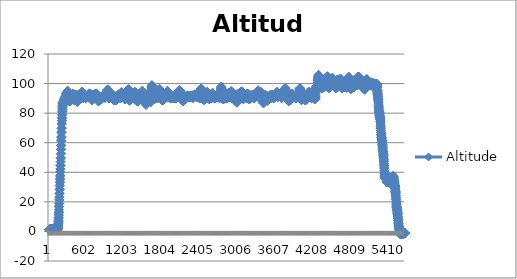
| Category | Altitude |
|---|---|
| 0 | 1.167 |
| 1 | 1.167 |
| 2 | 1.167 |
| 3 | 1.333 |
| 4 | 1.333 |
| 5 | 1.333 |
| 6 | 1.5 |
| 7 | 1.5 |
| 8 | 1.333 |
| 9 | 1.167 |
| 10 | 1.333 |
| 11 | 1.167 |
| 12 | 1.333 |
| 13 | 1.333 |
| 14 | 1.167 |
| 15 | 1.167 |
| 16 | 1.167 |
| 17 | 1.333 |
| 18 | 1.333 |
| 19 | 1.333 |
| 20 | 1.333 |
| 21 | 1.333 |
| 22 | 1.333 |
| 23 | 1.333 |
| 24 | 1.333 |
| 25 | 1.5 |
| 26 | 1.5 |
| 27 | 1.5 |
| 28 | 1.5 |
| 29 | 1.833 |
| 30 | 1.667 |
| 31 | 1.667 |
| 32 | 1.667 |
| 33 | 1.667 |
| 34 | 1.667 |
| 35 | 1.667 |
| 36 | 1.833 |
| 37 | 1.833 |
| 38 | 1.5 |
| 39 | 1.5 |
| 40 | 1.5 |
| 41 | 1.5 |
| 42 | 1.833 |
| 43 | 1.833 |
| 44 | 1.667 |
| 45 | 1.667 |
| 46 | 1.667 |
| 47 | 1.667 |
| 48 | 1.5 |
| 49 | 1.5 |
| 50 | 1.5 |
| 51 | 1.667 |
| 52 | 1.667 |
| 53 | 1.667 |
| 54 | 1.667 |
| 55 | 1.667 |
| 56 | 1.667 |
| 57 | 1.5 |
| 58 | 1.5 |
| 59 | 1.5 |
| 60 | 1.5 |
| 61 | 1.5 |
| 62 | 1.5 |
| 63 | 1.667 |
| 64 | 1.667 |
| 65 | 1.667 |
| 66 | 1.667 |
| 67 | 1.667 |
| 68 | 1.833 |
| 69 | 1.833 |
| 70 | 1.833 |
| 71 | 1.667 |
| 72 | 1.5 |
| 73 | 1.5 |
| 74 | 1.5 |
| 75 | 1.333 |
| 76 | 1.5 |
| 77 | 1.5 |
| 78 | 1.5 |
| 79 | 1.833 |
| 80 | 1.833 |
| 81 | 1.667 |
| 82 | 1.667 |
| 83 | 1.833 |
| 84 | 1.667 |
| 85 | 1.667 |
| 86 | 1.667 |
| 87 | 1.667 |
| 88 | 1.833 |
| 89 | 1.833 |
| 90 | 1.667 |
| 91 | 1.667 |
| 92 | 1.667 |
| 93 | 1.667 |
| 94 | 1.5 |
| 95 | 1.667 |
| 96 | 1.667 |
| 97 | 1.667 |
| 98 | 1.833 |
| 99 | 1.667 |
| 100 | 1.667 |
| 101 | 1.5 |
| 102 | 1.5 |
| 103 | 1.333 |
| 104 | 1.333 |
| 105 | 1.667 |
| 106 | 1.5 |
| 107 | 1.667 |
| 108 | 1.667 |
| 109 | 1.667 |
| 110 | 1.667 |
| 111 | 1.833 |
| 112 | 1.667 |
| 113 | 1.667 |
| 114 | 1.5 |
| 115 | 1.333 |
| 116 | 1.333 |
| 117 | 1.5 |
| 118 | 1.667 |
| 119 | 1.667 |
| 120 | 1.5 |
| 121 | 1.5 |
| 122 | 1.333 |
| 123 | 1.5 |
| 124 | 1.5 |
| 125 | 1.667 |
| 126 | 1.667 |
| 127 | 1.667 |
| 128 | 1.667 |
| 129 | 1.667 |
| 130 | 1.833 |
| 131 | 1.833 |
| 132 | 1.667 |
| 133 | 1.667 |
| 134 | 1.5 |
| 135 | 1 |
| 136 | 1.167 |
| 137 | 1.5 |
| 138 | 1.833 |
| 139 | 2.333 |
| 140 | 2.667 |
| 141 | 2.667 |
| 142 | 3.167 |
| 143 | 3.167 |
| 144 | 4.167 |
| 145 | 4.5 |
| 146 | 5.167 |
| 147 | 5.5 |
| 148 | 6.333 |
| 149 | 6.833 |
| 150 | 7.833 |
| 151 | 9.167 |
| 152 | 9.333 |
| 153 | 10.833 |
| 154 | 11.667 |
| 155 | 12.833 |
| 156 | 13.333 |
| 157 | 14.667 |
| 158 | 16.667 |
| 159 | 16.833 |
| 160 | 18.833 |
| 161 | 19 |
| 162 | 21.333 |
| 163 | 21.333 |
| 164 | 23.167 |
| 165 | 23.333 |
| 166 | 25.5 |
| 167 | 25.833 |
| 168 | 28.167 |
| 169 | 28.667 |
| 170 | 30.833 |
| 171 | 31.167 |
| 172 | 33 |
| 173 | 33.5 |
| 174 | 35.167 |
| 175 | 35.667 |
| 176 | 37.333 |
| 177 | 38 |
| 178 | 40.167 |
| 179 | 40.333 |
| 180 | 42.167 |
| 181 | 42.333 |
| 182 | 44.5 |
| 183 | 44.667 |
| 184 | 47.167 |
| 185 | 49.333 |
| 186 | 49.833 |
| 187 | 52.5 |
| 188 | 52.667 |
| 189 | 55.333 |
| 190 | 55.667 |
| 191 | 58 |
| 192 | 58.333 |
| 193 | 61.167 |
| 194 | 61.333 |
| 195 | 63.333 |
| 196 | 64.167 |
| 197 | 66.833 |
| 198 | 67.167 |
| 199 | 69.667 |
| 200 | 70 |
| 201 | 72.667 |
| 202 | 73.167 |
| 203 | 75 |
| 204 | 75 |
| 205 | 76.5 |
| 206 | 77 |
| 207 | 78.833 |
| 208 | 79 |
| 209 | 80.833 |
| 210 | 81 |
| 211 | 82.333 |
| 212 | 82.5 |
| 213 | 83.833 |
| 214 | 84 |
| 215 | 85.167 |
| 216 | 85.333 |
| 217 | 86.5 |
| 218 | 86.667 |
| 219 | 87.333 |
| 220 | 87.333 |
| 221 | 87.667 |
| 222 | 87.333 |
| 223 | 87 |
| 224 | 86.833 |
| 225 | 86.667 |
| 226 | 86.5 |
| 227 | 86 |
| 228 | 85.833 |
| 229 | 85.667 |
| 230 | 85.667 |
| 231 | 85.667 |
| 232 | 85.5 |
| 233 | 85.667 |
| 234 | 85.667 |
| 235 | 86 |
| 236 | 86 |
| 237 | 86.5 |
| 238 | 86.667 |
| 239 | 87.667 |
| 240 | 87.833 |
| 241 | 88.833 |
| 242 | 88.833 |
| 243 | 89.167 |
| 244 | 89.333 |
| 245 | 89.5 |
| 246 | 89.5 |
| 247 | 90 |
| 248 | 90 |
| 249 | 90.333 |
| 250 | 90.333 |
| 251 | 90.5 |
| 252 | 90.5 |
| 253 | 90.833 |
| 254 | 90.833 |
| 255 | 90.5 |
| 256 | 90.5 |
| 257 | 90.167 |
| 258 | 90.167 |
| 259 | 90.167 |
| 260 | 90.167 |
| 261 | 89.833 |
| 262 | 90 |
| 263 | 90 |
| 264 | 90.167 |
| 265 | 90.333 |
| 266 | 90.333 |
| 267 | 90.333 |
| 268 | 90.5 |
| 269 | 90.667 |
| 270 | 90.667 |
| 271 | 91.333 |
| 272 | 91.333 |
| 273 | 92.167 |
| 274 | 92.167 |
| 275 | 92.833 |
| 276 | 92.833 |
| 277 | 93.333 |
| 278 | 93.333 |
| 279 | 93.333 |
| 280 | 93.333 |
| 281 | 93.333 |
| 282 | 93.333 |
| 283 | 93.167 |
| 284 | 93.167 |
| 285 | 93 |
| 286 | 93 |
| 287 | 92.833 |
| 288 | 92.833 |
| 289 | 93.333 |
| 290 | 93.5 |
| 291 | 93.833 |
| 292 | 94.167 |
| 293 | 94.667 |
| 294 | 94.833 |
| 295 | 95 |
| 296 | 95 |
| 297 | 94.833 |
| 298 | 94.667 |
| 299 | 94 |
| 300 | 93.667 |
| 301 | 92.333 |
| 302 | 92.333 |
| 303 | 91.333 |
| 304 | 91.333 |
| 305 | 91.167 |
| 306 | 91.167 |
| 307 | 91 |
| 308 | 91 |
| 309 | 90.667 |
| 310 | 90.833 |
| 311 | 90.667 |
| 312 | 90.667 |
| 313 | 90.5 |
| 314 | 90.5 |
| 315 | 90.5 |
| 316 | 90.5 |
| 317 | 90.333 |
| 318 | 90.333 |
| 319 | 90 |
| 320 | 90 |
| 321 | 89.833 |
| 322 | 89.833 |
| 323 | 89.333 |
| 324 | 89.333 |
| 325 | 88.833 |
| 326 | 88.833 |
| 327 | 88.333 |
| 328 | 88.333 |
| 329 | 87.833 |
| 330 | 87.833 |
| 331 | 87.833 |
| 332 | 87.833 |
| 333 | 88 |
| 334 | 88 |
| 335 | 88.667 |
| 336 | 88.667 |
| 337 | 89.667 |
| 338 | 89.833 |
| 339 | 90.333 |
| 340 | 90.5 |
| 341 | 90.667 |
| 342 | 90.667 |
| 343 | 90.333 |
| 344 | 90.333 |
| 345 | 90.167 |
| 346 | 90 |
| 347 | 90.167 |
| 348 | 90 |
| 349 | 90 |
| 350 | 90 |
| 351 | 90 |
| 352 | 90 |
| 353 | 90 |
| 354 | 89.833 |
| 355 | 90 |
| 356 | 90 |
| 357 | 90 |
| 358 | 90.167 |
| 359 | 90.167 |
| 360 | 89.833 |
| 361 | 89.833 |
| 362 | 90 |
| 363 | 90 |
| 364 | 90.167 |
| 365 | 90.167 |
| 366 | 90.5 |
| 367 | 90.5 |
| 368 | 90.833 |
| 369 | 91 |
| 370 | 91.333 |
| 371 | 91.333 |
| 372 | 91.667 |
| 373 | 91.833 |
| 374 | 92.167 |
| 375 | 92.333 |
| 376 | 92.667 |
| 377 | 93 |
| 378 | 93 |
| 379 | 93 |
| 380 | 93 |
| 381 | 93.167 |
| 382 | 93 |
| 383 | 92.833 |
| 384 | 92.833 |
| 385 | 92.667 |
| 386 | 92.5 |
| 387 | 92 |
| 388 | 91.667 |
| 389 | 91 |
| 390 | 90.833 |
| 391 | 90.167 |
| 392 | 90.167 |
| 393 | 89.5 |
| 394 | 89.333 |
| 395 | 88.833 |
| 396 | 88.833 |
| 397 | 89 |
| 398 | 89 |
| 399 | 89.333 |
| 400 | 89.333 |
| 401 | 89.667 |
| 402 | 89.833 |
| 403 | 90.167 |
| 404 | 90.167 |
| 405 | 90.667 |
| 406 | 90.667 |
| 407 | 91.333 |
| 408 | 91.333 |
| 409 | 91.833 |
| 410 | 91.833 |
| 411 | 91.833 |
| 412 | 91.833 |
| 413 | 92.167 |
| 414 | 92.167 |
| 415 | 92.167 |
| 416 | 92.167 |
| 417 | 92.167 |
| 418 | 92.167 |
| 419 | 92.333 |
| 420 | 92.333 |
| 421 | 92.5 |
| 422 | 92.5 |
| 423 | 92.333 |
| 424 | 92.333 |
| 425 | 91.833 |
| 426 | 91.833 |
| 427 | 91.5 |
| 428 | 91.333 |
| 429 | 91 |
| 430 | 90.667 |
| 431 | 90.5 |
| 432 | 90.167 |
| 433 | 90.167 |
| 434 | 89.667 |
| 435 | 89.5 |
| 436 | 88.833 |
| 437 | 88.667 |
| 438 | 88.333 |
| 439 | 88.333 |
| 440 | 88 |
| 441 | 88.167 |
| 442 | 88 |
| 443 | 88.167 |
| 444 | 87.833 |
| 445 | 87.833 |
| 446 | 87.667 |
| 447 | 87.667 |
| 448 | 87.667 |
| 449 | 87.833 |
| 450 | 88.333 |
| 451 | 88.5 |
| 452 | 89.167 |
| 453 | 89.333 |
| 454 | 90.167 |
| 455 | 90.333 |
| 456 | 91 |
| 457 | 91 |
| 458 | 91.333 |
| 459 | 91.333 |
| 460 | 91.5 |
| 461 | 91.333 |
| 462 | 91 |
| 463 | 91 |
| 464 | 90.833 |
| 465 | 90.833 |
| 466 | 90.5 |
| 467 | 90.5 |
| 468 | 90.5 |
| 469 | 90.5 |
| 470 | 90.333 |
| 471 | 90.333 |
| 472 | 90.333 |
| 473 | 90.333 |
| 474 | 90.667 |
| 475 | 90.5 |
| 476 | 91 |
| 477 | 91.167 |
| 478 | 91.167 |
| 479 | 91 |
| 480 | 91 |
| 481 | 90.833 |
| 482 | 90.667 |
| 483 | 90.667 |
| 484 | 90.667 |
| 485 | 90.5 |
| 486 | 90.5 |
| 487 | 90.333 |
| 488 | 90.333 |
| 489 | 90.167 |
| 490 | 90.167 |
| 491 | 90.167 |
| 492 | 90.167 |
| 493 | 90.5 |
| 494 | 90.5 |
| 495 | 91.167 |
| 496 | 91.333 |
| 497 | 92 |
| 498 | 92.167 |
| 499 | 92.833 |
| 500 | 92.833 |
| 501 | 93.333 |
| 502 | 93.333 |
| 503 | 93.167 |
| 504 | 93.167 |
| 505 | 92.833 |
| 506 | 92.833 |
| 507 | 92.667 |
| 508 | 92.667 |
| 509 | 92.833 |
| 510 | 92.833 |
| 511 | 92.833 |
| 512 | 93 |
| 513 | 92.833 |
| 514 | 92.833 |
| 515 | 93 |
| 516 | 93 |
| 517 | 93 |
| 518 | 93.5 |
| 519 | 93.5 |
| 520 | 94.167 |
| 521 | 94.333 |
| 522 | 94.333 |
| 523 | 94.333 |
| 524 | 94.5 |
| 525 | 94.5 |
| 526 | 94.5 |
| 527 | 94.333 |
| 528 | 93.5 |
| 529 | 93.333 |
| 530 | 92.667 |
| 531 | 92.667 |
| 532 | 92 |
| 533 | 91.833 |
| 534 | 91.667 |
| 535 | 90.833 |
| 536 | 90.833 |
| 537 | 90.667 |
| 538 | 90.667 |
| 539 | 90.5 |
| 540 | 90.5 |
| 541 | 90.333 |
| 542 | 90.333 |
| 543 | 90.333 |
| 544 | 90.333 |
| 545 | 90.833 |
| 546 | 91.833 |
| 547 | 91.833 |
| 548 | 92.5 |
| 549 | 92.667 |
| 550 | 93.167 |
| 551 | 93.167 |
| 552 | 93.167 |
| 553 | 93.167 |
| 554 | 93.167 |
| 555 | 93.167 |
| 556 | 92.833 |
| 557 | 92.833 |
| 558 | 92.167 |
| 559 | 92.167 |
| 560 | 91.5 |
| 561 | 91.5 |
| 562 | 91.833 |
| 563 | 91.833 |
| 564 | 91.833 |
| 565 | 91.833 |
| 566 | 91.667 |
| 567 | 91.667 |
| 568 | 91.667 |
| 569 | 91.833 |
| 570 | 91.667 |
| 571 | 91.667 |
| 572 | 91.333 |
| 573 | 91.167 |
| 574 | 90.833 |
| 575 | 90.667 |
| 576 | 90.5 |
| 577 | 90.333 |
| 578 | 90.167 |
| 579 | 90.333 |
| 580 | 90.333 |
| 581 | 90.333 |
| 582 | 90.333 |
| 583 | 90.5 |
| 584 | 90.5 |
| 585 | 90.5 |
| 586 | 90.667 |
| 587 | 90.833 |
| 588 | 91 |
| 589 | 91.167 |
| 590 | 91.333 |
| 591 | 91.333 |
| 592 | 91.5 |
| 593 | 91.333 |
| 594 | 91.5 |
| 595 | 91.5 |
| 596 | 91.333 |
| 597 | 91.333 |
| 598 | 91 |
| 599 | 91 |
| 600 | 91 |
| 601 | 91.167 |
| 602 | 91.333 |
| 603 | 91.333 |
| 604 | 91.5 |
| 605 | 91.833 |
| 606 | 91.833 |
| 607 | 92.167 |
| 608 | 92.167 |
| 609 | 92.167 |
| 610 | 92.167 |
| 611 | 92 |
| 612 | 92.167 |
| 613 | 91.667 |
| 614 | 91.5 |
| 615 | 91.167 |
| 616 | 91.333 |
| 617 | 91.333 |
| 618 | 91.333 |
| 619 | 91.333 |
| 620 | 91.5 |
| 621 | 91.5 |
| 622 | 91.833 |
| 623 | 91.833 |
| 624 | 91.833 |
| 625 | 91.833 |
| 626 | 91.667 |
| 627 | 91.5 |
| 628 | 91.167 |
| 629 | 91.167 |
| 630 | 91.167 |
| 631 | 91.167 |
| 632 | 91 |
| 633 | 91 |
| 634 | 91.333 |
| 635 | 91.333 |
| 636 | 91.667 |
| 637 | 91.667 |
| 638 | 92 |
| 639 | 92.333 |
| 640 | 93 |
| 641 | 93 |
| 642 | 93.333 |
| 643 | 93.333 |
| 644 | 93.333 |
| 645 | 93.333 |
| 646 | 93.167 |
| 647 | 93.167 |
| 648 | 93.167 |
| 649 | 93 |
| 650 | 92.667 |
| 651 | 92.5 |
| 652 | 92.167 |
| 653 | 92.167 |
| 654 | 92 |
| 655 | 91.833 |
| 656 | 91.333 |
| 657 | 91.333 |
| 658 | 90.5 |
| 659 | 90.333 |
| 660 | 89.833 |
| 661 | 89.833 |
| 662 | 89.5 |
| 663 | 89.5 |
| 664 | 89.5 |
| 665 | 89.5 |
| 666 | 89.5 |
| 667 | 89.5 |
| 668 | 89.333 |
| 669 | 89.333 |
| 670 | 89.5 |
| 671 | 89.5 |
| 672 | 89.333 |
| 673 | 89.333 |
| 674 | 89 |
| 675 | 88.833 |
| 676 | 88.833 |
| 677 | 88.833 |
| 678 | 88.833 |
| 679 | 88.833 |
| 680 | 89 |
| 681 | 89 |
| 682 | 89.167 |
| 683 | 89.333 |
| 684 | 89.667 |
| 685 | 89.667 |
| 686 | 89.833 |
| 687 | 89.833 |
| 688 | 90.167 |
| 689 | 90.333 |
| 690 | 90.833 |
| 691 | 90.833 |
| 692 | 91.333 |
| 693 | 91.5 |
| 694 | 92 |
| 695 | 92 |
| 696 | 92.333 |
| 697 | 92.167 |
| 698 | 92.5 |
| 699 | 92.5 |
| 700 | 92.333 |
| 701 | 92.333 |
| 702 | 92.167 |
| 703 | 92.167 |
| 704 | 92.167 |
| 705 | 92.167 |
| 706 | 91.833 |
| 707 | 91.667 |
| 708 | 91.5 |
| 709 | 91.333 |
| 710 | 91.333 |
| 711 | 91 |
| 712 | 91.167 |
| 713 | 91.167 |
| 714 | 91.167 |
| 715 | 91.333 |
| 716 | 91.333 |
| 717 | 91.333 |
| 718 | 91.5 |
| 719 | 91.833 |
| 720 | 91.833 |
| 721 | 92.333 |
| 722 | 92.333 |
| 723 | 92.667 |
| 724 | 92.667 |
| 725 | 92.833 |
| 726 | 93 |
| 727 | 92.667 |
| 728 | 92.833 |
| 729 | 92.5 |
| 730 | 92.5 |
| 731 | 92.833 |
| 732 | 92.833 |
| 733 | 92.667 |
| 734 | 92.5 |
| 735 | 92.167 |
| 736 | 92.333 |
| 737 | 92.333 |
| 738 | 92.333 |
| 739 | 92.333 |
| 740 | 92.167 |
| 741 | 92.167 |
| 742 | 92.167 |
| 743 | 92.167 |
| 744 | 92.5 |
| 745 | 92.5 |
| 746 | 92.833 |
| 747 | 93.167 |
| 748 | 93.167 |
| 749 | 93.333 |
| 750 | 93.167 |
| 751 | 92.833 |
| 752 | 92.833 |
| 753 | 92.167 |
| 754 | 92.167 |
| 755 | 92 |
| 756 | 92 |
| 757 | 91.667 |
| 758 | 91.667 |
| 759 | 91.5 |
| 760 | 91.333 |
| 761 | 91 |
| 762 | 91 |
| 763 | 90.5 |
| 764 | 90.5 |
| 765 | 90.167 |
| 766 | 90.167 |
| 767 | 89.833 |
| 768 | 89.833 |
| 769 | 89.333 |
| 770 | 89.333 |
| 771 | 89.167 |
| 772 | 89.167 |
| 773 | 89.167 |
| 774 | 89.167 |
| 775 | 89 |
| 776 | 89 |
| 777 | 88.5 |
| 778 | 88.5 |
| 779 | 88.333 |
| 780 | 88.333 |
| 781 | 88 |
| 782 | 88.167 |
| 783 | 88 |
| 784 | 88 |
| 785 | 88.333 |
| 786 | 88.5 |
| 787 | 88.667 |
| 788 | 89 |
| 789 | 89 |
| 790 | 89.333 |
| 791 | 89.333 |
| 792 | 89.333 |
| 793 | 89.333 |
| 794 | 89.5 |
| 795 | 89.5 |
| 796 | 89.333 |
| 797 | 89.333 |
| 798 | 89.667 |
| 799 | 89.667 |
| 800 | 89.833 |
| 801 | 90 |
| 802 | 90.167 |
| 803 | 90.333 |
| 804 | 90.333 |
| 805 | 90.5 |
| 806 | 90.5 |
| 807 | 90.667 |
| 808 | 90.5 |
| 809 | 90.667 |
| 810 | 90.667 |
| 811 | 90.667 |
| 812 | 90.667 |
| 813 | 90.667 |
| 814 | 90.667 |
| 815 | 90.333 |
| 816 | 90.333 |
| 817 | 90.167 |
| 818 | 90.333 |
| 819 | 90.333 |
| 820 | 90.333 |
| 821 | 90.333 |
| 822 | 90.333 |
| 823 | 90 |
| 824 | 90 |
| 825 | 90 |
| 826 | 90 |
| 827 | 89.833 |
| 828 | 89.833 |
| 829 | 89.667 |
| 830 | 89.5 |
| 831 | 89.5 |
| 832 | 89.5 |
| 833 | 89.833 |
| 834 | 90.167 |
| 835 | 90 |
| 836 | 90.167 |
| 837 | 90.5 |
| 838 | 90.5 |
| 839 | 90.5 |
| 840 | 90.5 |
| 841 | 90.5 |
| 842 | 90.5 |
| 843 | 90.5 |
| 844 | 90.5 |
| 845 | 90.5 |
| 846 | 90.5 |
| 847 | 90.667 |
| 848 | 90.667 |
| 849 | 90.667 |
| 850 | 90.667 |
| 851 | 90.833 |
| 852 | 90.833 |
| 853 | 90.833 |
| 854 | 90.833 |
| 855 | 91 |
| 856 | 91.167 |
| 857 | 91.167 |
| 858 | 91.167 |
| 859 | 91.5 |
| 860 | 91.667 |
| 861 | 91.5 |
| 862 | 91.5 |
| 863 | 92 |
| 864 | 92 |
| 865 | 92 |
| 866 | 92.167 |
| 867 | 92.5 |
| 868 | 92.5 |
| 869 | 92.667 |
| 870 | 92.667 |
| 871 | 92.333 |
| 872 | 92.333 |
| 873 | 92 |
| 874 | 91.833 |
| 875 | 91.5 |
| 876 | 91.333 |
| 877 | 91 |
| 878 | 91 |
| 879 | 90.667 |
| 880 | 90.667 |
| 881 | 90.5 |
| 882 | 90.5 |
| 883 | 90.333 |
| 884 | 90.5 |
| 885 | 90.667 |
| 886 | 90.667 |
| 887 | 91.167 |
| 888 | 91.167 |
| 889 | 91.833 |
| 890 | 91.833 |
| 891 | 92.167 |
| 892 | 92.167 |
| 893 | 92.5 |
| 894 | 92.5 |
| 895 | 92.5 |
| 896 | 92.5 |
| 897 | 92.667 |
| 898 | 92.667 |
| 899 | 92.5 |
| 900 | 92.5 |
| 901 | 92.333 |
| 902 | 92.333 |
| 903 | 92.333 |
| 904 | 92.333 |
| 905 | 92 |
| 906 | 92 |
| 907 | 92.167 |
| 908 | 92.167 |
| 909 | 92.833 |
| 910 | 92.667 |
| 911 | 93.333 |
| 912 | 93.333 |
| 913 | 93.5 |
| 914 | 93.833 |
| 915 | 93.833 |
| 916 | 93.667 |
| 917 | 93.833 |
| 918 | 94.167 |
| 919 | 94.167 |
| 920 | 94.333 |
| 921 | 94.5 |
| 922 | 94.833 |
| 923 | 95 |
| 924 | 95 |
| 925 | 95 |
| 926 | 95.333 |
| 927 | 95.333 |
| 928 | 96 |
| 929 | 96 |
| 930 | 95.833 |
| 931 | 95.833 |
| 932 | 95.833 |
| 933 | 95.833 |
| 934 | 95.5 |
| 935 | 95.667 |
| 936 | 95.333 |
| 937 | 95.333 |
| 938 | 94.5 |
| 939 | 94.333 |
| 940 | 93.167 |
| 941 | 93 |
| 942 | 91.667 |
| 943 | 91.5 |
| 944 | 90.833 |
| 945 | 90.833 |
| 946 | 90.167 |
| 947 | 90.167 |
| 948 | 89.833 |
| 949 | 89.833 |
| 950 | 90.167 |
| 951 | 90.333 |
| 952 | 90.833 |
| 953 | 91 |
| 954 | 91.5 |
| 955 | 91.667 |
| 956 | 92.333 |
| 957 | 92.5 |
| 958 | 93 |
| 959 | 93 |
| 960 | 93.333 |
| 961 | 93.167 |
| 962 | 93.667 |
| 963 | 93.667 |
| 964 | 93.833 |
| 965 | 93.833 |
| 966 | 93.5 |
| 967 | 93.5 |
| 968 | 92.833 |
| 969 | 92.667 |
| 970 | 91.833 |
| 971 | 91.833 |
| 972 | 91.167 |
| 973 | 91.167 |
| 974 | 90.833 |
| 975 | 90.667 |
| 976 | 90.5 |
| 977 | 90.5 |
| 978 | 90.667 |
| 979 | 91 |
| 980 | 91 |
| 981 | 91.5 |
| 982 | 91.667 |
| 983 | 92.333 |
| 984 | 92.5 |
| 985 | 92.667 |
| 986 | 93 |
| 987 | 93 |
| 988 | 93.167 |
| 989 | 93.167 |
| 990 | 93 |
| 991 | 93 |
| 992 | 92.5 |
| 993 | 92 |
| 994 | 92 |
| 995 | 91.333 |
| 996 | 91.333 |
| 997 | 91 |
| 998 | 91.167 |
| 999 | 90.833 |
| 1000 | 90.833 |
| 1001 | 91 |
| 1002 | 91.167 |
| 1003 | 91.333 |
| 1004 | 91.333 |
| 1005 | 91.5 |
| 1006 | 91.5 |
| 1007 | 91.833 |
| 1008 | 91.833 |
| 1009 | 91.833 |
| 1010 | 91.833 |
| 1011 | 91.833 |
| 1012 | 91.667 |
| 1013 | 91.5 |
| 1014 | 91.167 |
| 1015 | 91.167 |
| 1016 | 90.833 |
| 1017 | 90.833 |
| 1018 | 90.5 |
| 1019 | 90.333 |
| 1020 | 90.167 |
| 1021 | 90.167 |
| 1022 | 89.833 |
| 1023 | 89.667 |
| 1024 | 89.333 |
| 1025 | 89.333 |
| 1026 | 88.833 |
| 1027 | 88.833 |
| 1028 | 88.667 |
| 1029 | 88.667 |
| 1030 | 88.667 |
| 1031 | 88.667 |
| 1032 | 88.667 |
| 1033 | 88.667 |
| 1034 | 88.667 |
| 1035 | 88.667 |
| 1036 | 88.667 |
| 1037 | 88.667 |
| 1038 | 88.833 |
| 1039 | 88.667 |
| 1040 | 88.667 |
| 1041 | 88.667 |
| 1042 | 88.833 |
| 1043 | 88.833 |
| 1044 | 89 |
| 1045 | 89 |
| 1046 | 89 |
| 1047 | 89.167 |
| 1048 | 88.833 |
| 1049 | 89 |
| 1050 | 88.833 |
| 1051 | 88.833 |
| 1052 | 88.833 |
| 1053 | 88.833 |
| 1054 | 89 |
| 1055 | 89.167 |
| 1056 | 89 |
| 1057 | 89 |
| 1058 | 89 |
| 1059 | 88.833 |
| 1060 | 88.833 |
| 1061 | 88.833 |
| 1062 | 88.833 |
| 1063 | 88.833 |
| 1064 | 88.833 |
| 1065 | 88.833 |
| 1066 | 89.167 |
| 1067 | 89 |
| 1068 | 89.167 |
| 1069 | 89.167 |
| 1070 | 89.5 |
| 1071 | 89.667 |
| 1072 | 90 |
| 1073 | 90 |
| 1074 | 90.333 |
| 1075 | 90.333 |
| 1076 | 90.667 |
| 1077 | 90.833 |
| 1078 | 91.167 |
| 1079 | 91.333 |
| 1080 | 91.667 |
| 1081 | 91.667 |
| 1082 | 91.833 |
| 1083 | 91.833 |
| 1084 | 91.667 |
| 1085 | 91.667 |
| 1086 | 92 |
| 1087 | 92 |
| 1088 | 92.333 |
| 1089 | 92.333 |
| 1090 | 92 |
| 1091 | 92 |
| 1092 | 91.333 |
| 1093 | 91.333 |
| 1094 | 91 |
| 1095 | 91 |
| 1096 | 91 |
| 1097 | 91 |
| 1098 | 91 |
| 1099 | 91 |
| 1100 | 91.167 |
| 1101 | 91.167 |
| 1102 | 91.667 |
| 1103 | 91.667 |
| 1104 | 91.833 |
| 1105 | 92 |
| 1106 | 92.333 |
| 1107 | 92.333 |
| 1108 | 92.167 |
| 1109 | 92.167 |
| 1110 | 92 |
| 1111 | 91.833 |
| 1112 | 91.667 |
| 1113 | 91.667 |
| 1114 | 91.667 |
| 1115 | 91.5 |
| 1116 | 91.167 |
| 1117 | 91 |
| 1118 | 91 |
| 1119 | 91 |
| 1120 | 91 |
| 1121 | 90.833 |
| 1122 | 90.833 |
| 1123 | 90.667 |
| 1124 | 90.667 |
| 1125 | 90.333 |
| 1126 | 90.333 |
| 1127 | 90.333 |
| 1128 | 90.333 |
| 1129 | 90.333 |
| 1130 | 90.333 |
| 1131 | 90.167 |
| 1132 | 90.5 |
| 1133 | 90.667 |
| 1134 | 91 |
| 1135 | 90.833 |
| 1136 | 91.333 |
| 1137 | 91.5 |
| 1138 | 92.167 |
| 1139 | 92.167 |
| 1140 | 93.167 |
| 1141 | 93.167 |
| 1142 | 93.833 |
| 1143 | 93.833 |
| 1144 | 94 |
| 1145 | 94.167 |
| 1146 | 94 |
| 1147 | 94 |
| 1148 | 94 |
| 1149 | 94.167 |
| 1150 | 93.833 |
| 1151 | 93.667 |
| 1152 | 93.5 |
| 1153 | 93.5 |
| 1154 | 93.333 |
| 1155 | 93.333 |
| 1156 | 93.5 |
| 1157 | 93.5 |
| 1158 | 93.5 |
| 1159 | 93.5 |
| 1160 | 93.167 |
| 1161 | 93.167 |
| 1162 | 92.833 |
| 1163 | 93 |
| 1164 | 92.833 |
| 1165 | 92.833 |
| 1166 | 92.333 |
| 1167 | 92.167 |
| 1168 | 92.333 |
| 1169 | 92.5 |
| 1170 | 92.667 |
| 1171 | 93.167 |
| 1172 | 93.167 |
| 1173 | 93.333 |
| 1174 | 93.333 |
| 1175 | 92.833 |
| 1176 | 92.833 |
| 1177 | 91.833 |
| 1178 | 91.833 |
| 1179 | 91.333 |
| 1180 | 90.833 |
| 1181 | 90.833 |
| 1182 | 90.667 |
| 1183 | 90.667 |
| 1184 | 90.667 |
| 1185 | 90.667 |
| 1186 | 90.667 |
| 1187 | 90.667 |
| 1188 | 90.667 |
| 1189 | 90.667 |
| 1190 | 90.667 |
| 1191 | 90.667 |
| 1192 | 90.667 |
| 1193 | 90.667 |
| 1194 | 90.5 |
| 1195 | 90.5 |
| 1196 | 90.333 |
| 1197 | 89.833 |
| 1198 | 89.833 |
| 1199 | 89.667 |
| 1200 | 89.667 |
| 1201 | 89.667 |
| 1202 | 89.5 |
| 1203 | 89.5 |
| 1204 | 89.333 |
| 1205 | 89.333 |
| 1206 | 89.333 |
| 1207 | 89.333 |
| 1208 | 89.5 |
| 1209 | 89.667 |
| 1210 | 89.667 |
| 1211 | 90 |
| 1212 | 90 |
| 1213 | 90 |
| 1214 | 90.167 |
| 1215 | 90.167 |
| 1216 | 90.333 |
| 1217 | 90.333 |
| 1218 | 90.667 |
| 1219 | 90.667 |
| 1220 | 90.667 |
| 1221 | 90.667 |
| 1222 | 90.667 |
| 1223 | 90.667 |
| 1224 | 90.667 |
| 1225 | 90.667 |
| 1226 | 90.833 |
| 1227 | 91 |
| 1228 | 91.167 |
| 1229 | 91.167 |
| 1230 | 91.333 |
| 1231 | 91.333 |
| 1232 | 91.333 |
| 1233 | 91.5 |
| 1234 | 92 |
| 1235 | 92.167 |
| 1236 | 92.5 |
| 1237 | 92.667 |
| 1238 | 92.833 |
| 1239 | 92.833 |
| 1240 | 93 |
| 1241 | 93.167 |
| 1242 | 93.667 |
| 1243 | 93.5 |
| 1244 | 94 |
| 1245 | 94 |
| 1246 | 94.5 |
| 1247 | 94.5 |
| 1248 | 94.5 |
| 1249 | 94.5 |
| 1250 | 94.833 |
| 1251 | 94.833 |
| 1252 | 95.667 |
| 1253 | 96 |
| 1254 | 96.167 |
| 1255 | 96.167 |
| 1256 | 96 |
| 1257 | 96 |
| 1258 | 95.5 |
| 1259 | 95.5 |
| 1260 | 95.333 |
| 1261 | 95.167 |
| 1262 | 93.667 |
| 1263 | 93.333 |
| 1264 | 91.333 |
| 1265 | 91.167 |
| 1266 | 89.833 |
| 1267 | 89.667 |
| 1268 | 88.833 |
| 1269 | 88.833 |
| 1270 | 88.5 |
| 1271 | 88.5 |
| 1272 | 88.5 |
| 1273 | 88.5 |
| 1274 | 88.5 |
| 1275 | 88.667 |
| 1276 | 89 |
| 1277 | 89 |
| 1278 | 89 |
| 1279 | 89 |
| 1280 | 89.5 |
| 1281 | 89.667 |
| 1282 | 90 |
| 1283 | 90 |
| 1284 | 89.833 |
| 1285 | 89.833 |
| 1286 | 89.833 |
| 1287 | 89.833 |
| 1288 | 89.833 |
| 1289 | 90 |
| 1290 | 89.833 |
| 1291 | 89.833 |
| 1292 | 89.833 |
| 1293 | 90.333 |
| 1294 | 90.333 |
| 1295 | 90.833 |
| 1296 | 90.833 |
| 1297 | 91.333 |
| 1298 | 91.5 |
| 1299 | 92.167 |
| 1300 | 92.167 |
| 1301 | 92.5 |
| 1302 | 92.667 |
| 1303 | 92.5 |
| 1304 | 92.5 |
| 1305 | 92.167 |
| 1306 | 92.333 |
| 1307 | 92.333 |
| 1308 | 92.5 |
| 1309 | 92.5 |
| 1310 | 92.333 |
| 1311 | 92.333 |
| 1312 | 92.833 |
| 1313 | 92.833 |
| 1314 | 93 |
| 1315 | 93 |
| 1316 | 93.167 |
| 1317 | 93.167 |
| 1318 | 93.5 |
| 1319 | 93.5 |
| 1320 | 93.333 |
| 1321 | 93.333 |
| 1322 | 92.833 |
| 1323 | 92.667 |
| 1324 | 92 |
| 1325 | 92 |
| 1326 | 91.333 |
| 1327 | 91.333 |
| 1328 | 90.5 |
| 1329 | 90.333 |
| 1330 | 90 |
| 1331 | 90 |
| 1332 | 89.833 |
| 1333 | 89.833 |
| 1334 | 89.833 |
| 1335 | 89.833 |
| 1336 | 90 |
| 1337 | 90.167 |
| 1338 | 90.167 |
| 1339 | 90.333 |
| 1340 | 90.167 |
| 1341 | 90.167 |
| 1342 | 90.5 |
| 1343 | 90.5 |
| 1344 | 91 |
| 1345 | 91 |
| 1346 | 91.5 |
| 1347 | 91.5 |
| 1348 | 91.833 |
| 1349 | 91.833 |
| 1350 | 92.333 |
| 1351 | 92.5 |
| 1352 | 93 |
| 1353 | 93 |
| 1354 | 93.333 |
| 1355 | 93.333 |
| 1356 | 94 |
| 1357 | 94 |
| 1358 | 94.167 |
| 1359 | 94.167 |
| 1360 | 94.167 |
| 1361 | 94.167 |
| 1362 | 94 |
| 1363 | 93.833 |
| 1364 | 93.5 |
| 1365 | 93.5 |
| 1366 | 93.667 |
| 1367 | 93.667 |
| 1368 | 93.833 |
| 1369 | 93.667 |
| 1370 | 93.667 |
| 1371 | 93.667 |
| 1372 | 93.667 |
| 1373 | 93.667 |
| 1374 | 93.333 |
| 1375 | 93.333 |
| 1376 | 92.833 |
| 1377 | 92.5 |
| 1378 | 92.333 |
| 1379 | 92.333 |
| 1380 | 92 |
| 1381 | 91.833 |
| 1382 | 91.667 |
| 1383 | 91.667 |
| 1384 | 91 |
| 1385 | 90.833 |
| 1386 | 90.667 |
| 1387 | 90.667 |
| 1388 | 90.333 |
| 1389 | 90.333 |
| 1390 | 90.333 |
| 1391 | 90.167 |
| 1392 | 89.833 |
| 1393 | 89.667 |
| 1394 | 89.333 |
| 1395 | 89.167 |
| 1396 | 89 |
| 1397 | 88.667 |
| 1398 | 88.5 |
| 1399 | 88.5 |
| 1400 | 88.5 |
| 1401 | 87.833 |
| 1402 | 87.833 |
| 1403 | 87.833 |
| 1404 | 87.833 |
| 1405 | 88.167 |
| 1406 | 88.333 |
| 1407 | 88.667 |
| 1408 | 88.833 |
| 1409 | 89 |
| 1410 | 89.167 |
| 1411 | 89.667 |
| 1412 | 89.667 |
| 1413 | 90 |
| 1414 | 90.333 |
| 1415 | 90.333 |
| 1416 | 90.333 |
| 1417 | 90.333 |
| 1418 | 90 |
| 1419 | 89.833 |
| 1420 | 89.667 |
| 1421 | 89.5 |
| 1422 | 89.333 |
| 1423 | 89.333 |
| 1424 | 89.5 |
| 1425 | 89.5 |
| 1426 | 90 |
| 1427 | 90 |
| 1428 | 90.5 |
| 1429 | 90.667 |
| 1430 | 91.167 |
| 1431 | 91.333 |
| 1432 | 91.833 |
| 1433 | 92 |
| 1434 | 91.833 |
| 1435 | 91.833 |
| 1436 | 91.667 |
| 1437 | 91.667 |
| 1438 | 91.5 |
| 1439 | 91.667 |
| 1440 | 91.833 |
| 1441 | 91.833 |
| 1442 | 92.5 |
| 1443 | 92.5 |
| 1444 | 92.667 |
| 1445 | 92.667 |
| 1446 | 93 |
| 1447 | 93 |
| 1448 | 92.667 |
| 1449 | 92.667 |
| 1450 | 92.667 |
| 1451 | 92.667 |
| 1452 | 92.5 |
| 1453 | 92.5 |
| 1454 | 92 |
| 1455 | 91.833 |
| 1456 | 91.833 |
| 1457 | 91.333 |
| 1458 | 91.5 |
| 1459 | 91.5 |
| 1460 | 91.5 |
| 1461 | 92.167 |
| 1462 | 92.167 |
| 1463 | 92.667 |
| 1464 | 92.833 |
| 1465 | 93.5 |
| 1466 | 93.5 |
| 1467 | 94.167 |
| 1468 | 94.333 |
| 1469 | 94.167 |
| 1470 | 94.167 |
| 1471 | 94.167 |
| 1472 | 94.167 |
| 1473 | 94.833 |
| 1474 | 94.833 |
| 1475 | 95 |
| 1476 | 95 |
| 1477 | 94.833 |
| 1478 | 94.833 |
| 1479 | 94.833 |
| 1480 | 94.833 |
| 1481 | 94.833 |
| 1482 | 94.667 |
| 1483 | 94.333 |
| 1484 | 94.333 |
| 1485 | 93.833 |
| 1486 | 93.833 |
| 1487 | 93.5 |
| 1488 | 93.5 |
| 1489 | 92.833 |
| 1490 | 92.833 |
| 1491 | 92.167 |
| 1492 | 92.167 |
| 1493 | 91.833 |
| 1494 | 91.833 |
| 1495 | 91.667 |
| 1496 | 91.833 |
| 1497 | 92.167 |
| 1498 | 92.167 |
| 1499 | 92.333 |
| 1500 | 92.167 |
| 1501 | 91.833 |
| 1502 | 91.833 |
| 1503 | 92 |
| 1504 | 92.333 |
| 1505 | 92.333 |
| 1506 | 92.333 |
| 1507 | 91.833 |
| 1508 | 91.833 |
| 1509 | 91.833 |
| 1510 | 91.667 |
| 1511 | 91.5 |
| 1512 | 91.333 |
| 1513 | 91.167 |
| 1514 | 91 |
| 1515 | 90.667 |
| 1516 | 90.5 |
| 1517 | 90.333 |
| 1518 | 90.333 |
| 1519 | 90.167 |
| 1520 | 90.167 |
| 1521 | 90.5 |
| 1522 | 90.5 |
| 1523 | 90.167 |
| 1524 | 90.167 |
| 1525 | 89 |
| 1526 | 88.833 |
| 1527 | 87.5 |
| 1528 | 87.5 |
| 1529 | 86.833 |
| 1530 | 86.833 |
| 1531 | 86.167 |
| 1532 | 86.167 |
| 1533 | 85.667 |
| 1534 | 85.667 |
| 1535 | 86.333 |
| 1536 | 86.333 |
| 1537 | 87.5 |
| 1538 | 87.5 |
| 1539 | 88.667 |
| 1540 | 88.667 |
| 1541 | 89.333 |
| 1542 | 89.333 |
| 1543 | 89.833 |
| 1544 | 89.833 |
| 1545 | 89.833 |
| 1546 | 89.833 |
| 1547 | 89.667 |
| 1548 | 89.667 |
| 1549 | 89.5 |
| 1550 | 89.5 |
| 1551 | 89.5 |
| 1552 | 89.5 |
| 1553 | 89.667 |
| 1554 | 89.667 |
| 1555 | 89.667 |
| 1556 | 89.667 |
| 1557 | 90 |
| 1558 | 90 |
| 1559 | 90.5 |
| 1560 | 90.5 |
| 1561 | 91 |
| 1562 | 91.667 |
| 1563 | 91.667 |
| 1564 | 92.167 |
| 1565 | 92.167 |
| 1566 | 92.5 |
| 1567 | 92.5 |
| 1568 | 92.833 |
| 1569 | 92.833 |
| 1570 | 93 |
| 1571 | 92.833 |
| 1572 | 92.667 |
| 1573 | 92.667 |
| 1574 | 92.5 |
| 1575 | 92.5 |
| 1576 | 92.333 |
| 1577 | 92.167 |
| 1578 | 91.833 |
| 1579 | 91.833 |
| 1580 | 91 |
| 1581 | 91 |
| 1582 | 90.333 |
| 1583 | 90.333 |
| 1584 | 89.5 |
| 1585 | 89.5 |
| 1586 | 89.167 |
| 1587 | 89.167 |
| 1588 | 89 |
| 1589 | 89 |
| 1590 | 88.833 |
| 1591 | 88.667 |
| 1592 | 88.5 |
| 1593 | 88.333 |
| 1594 | 88.5 |
| 1595 | 88.333 |
| 1596 | 88.333 |
| 1597 | 88.667 |
| 1598 | 88.667 |
| 1599 | 89 |
| 1600 | 89 |
| 1601 | 88.833 |
| 1602 | 88.667 |
| 1603 | 88.333 |
| 1604 | 88.333 |
| 1605 | 88 |
| 1606 | 88 |
| 1607 | 87.5 |
| 1608 | 87.5 |
| 1609 | 87.667 |
| 1610 | 87.5 |
| 1611 | 88 |
| 1612 | 88 |
| 1613 | 88.833 |
| 1614 | 88.833 |
| 1615 | 89.5 |
| 1616 | 90.833 |
| 1617 | 91 |
| 1618 | 92.167 |
| 1619 | 92.333 |
| 1620 | 94.667 |
| 1621 | 94.833 |
| 1622 | 96.333 |
| 1623 | 96.333 |
| 1624 | 97.167 |
| 1625 | 97.333 |
| 1626 | 98.167 |
| 1627 | 98.167 |
| 1628 | 99 |
| 1629 | 98.667 |
| 1630 | 97.333 |
| 1631 | 97.333 |
| 1632 | 96 |
| 1633 | 95.833 |
| 1634 | 94.833 |
| 1635 | 94.333 |
| 1636 | 93.5 |
| 1637 | 93 |
| 1638 | 92 |
| 1639 | 92 |
| 1640 | 91.333 |
| 1641 | 91.333 |
| 1642 | 90.833 |
| 1643 | 90.667 |
| 1644 | 90.5 |
| 1645 | 90.5 |
| 1646 | 90.333 |
| 1647 | 90.333 |
| 1648 | 90.333 |
| 1649 | 90.333 |
| 1650 | 90.333 |
| 1651 | 90.333 |
| 1652 | 90.333 |
| 1653 | 90.333 |
| 1654 | 90.5 |
| 1655 | 90.5 |
| 1656 | 90.333 |
| 1657 | 90.333 |
| 1658 | 89.833 |
| 1659 | 89.833 |
| 1660 | 89.333 |
| 1661 | 89.333 |
| 1662 | 89.333 |
| 1663 | 89.333 |
| 1664 | 89.333 |
| 1665 | 89.5 |
| 1666 | 89.667 |
| 1667 | 89.667 |
| 1668 | 89.667 |
| 1669 | 89.833 |
| 1670 | 90 |
| 1671 | 90 |
| 1672 | 90.167 |
| 1673 | 90 |
| 1674 | 90.333 |
| 1675 | 90.333 |
| 1676 | 90.5 |
| 1677 | 90.833 |
| 1678 | 90.833 |
| 1679 | 90.833 |
| 1680 | 90.833 |
| 1681 | 90.833 |
| 1682 | 90.833 |
| 1683 | 90.5 |
| 1684 | 90.5 |
| 1685 | 90.333 |
| 1686 | 90.333 |
| 1687 | 90.333 |
| 1688 | 90.167 |
| 1689 | 90.333 |
| 1690 | 90.333 |
| 1691 | 90.333 |
| 1692 | 90.333 |
| 1693 | 90.333 |
| 1694 | 90.5 |
| 1695 | 90.5 |
| 1696 | 90.333 |
| 1697 | 90.333 |
| 1698 | 90.167 |
| 1699 | 90.167 |
| 1700 | 90.167 |
| 1701 | 90.167 |
| 1702 | 90.167 |
| 1703 | 90 |
| 1704 | 90 |
| 1705 | 90 |
| 1706 | 90 |
| 1707 | 90.167 |
| 1708 | 90.5 |
| 1709 | 90.5 |
| 1710 | 91 |
| 1711 | 91 |
| 1712 | 91.333 |
| 1713 | 91.333 |
| 1714 | 92 |
| 1715 | 92 |
| 1716 | 92 |
| 1717 | 92 |
| 1718 | 92.5 |
| 1719 | 92.5 |
| 1720 | 93 |
| 1721 | 93 |
| 1722 | 92.833 |
| 1723 | 92.833 |
| 1724 | 92.167 |
| 1725 | 91.667 |
| 1726 | 91.667 |
| 1727 | 91.333 |
| 1728 | 91.167 |
| 1729 | 91.333 |
| 1730 | 91.5 |
| 1731 | 92 |
| 1732 | 92.167 |
| 1733 | 93 |
| 1734 | 93.167 |
| 1735 | 93.833 |
| 1736 | 94 |
| 1737 | 94.5 |
| 1738 | 94.667 |
| 1739 | 94.667 |
| 1740 | 94.667 |
| 1741 | 95.333 |
| 1742 | 95.333 |
| 1743 | 95.5 |
| 1744 | 95.5 |
| 1745 | 95.667 |
| 1746 | 95.667 |
| 1747 | 96 |
| 1748 | 96.167 |
| 1749 | 96.333 |
| 1750 | 96.333 |
| 1751 | 95.5 |
| 1752 | 95.333 |
| 1753 | 94 |
| 1754 | 94 |
| 1755 | 93.5 |
| 1756 | 93.5 |
| 1757 | 93.333 |
| 1758 | 93.167 |
| 1759 | 92.833 |
| 1760 | 92.5 |
| 1761 | 92.167 |
| 1762 | 92 |
| 1763 | 92 |
| 1764 | 92.167 |
| 1765 | 92.167 |
| 1766 | 92 |
| 1767 | 92 |
| 1768 | 92.333 |
| 1769 | 92.333 |
| 1770 | 92.333 |
| 1771 | 92 |
| 1772 | 92 |
| 1773 | 91.333 |
| 1774 | 91.333 |
| 1775 | 90.833 |
| 1776 | 90.833 |
| 1777 | 90.167 |
| 1778 | 90.167 |
| 1779 | 89.833 |
| 1780 | 89.667 |
| 1781 | 89.167 |
| 1782 | 89.333 |
| 1783 | 89.167 |
| 1784 | 89.167 |
| 1785 | 89 |
| 1786 | 89 |
| 1787 | 89 |
| 1788 | 89 |
| 1789 | 89 |
| 1790 | 89 |
| 1791 | 88.833 |
| 1792 | 88.833 |
| 1793 | 88.833 |
| 1794 | 88.833 |
| 1795 | 89 |
| 1796 | 88.833 |
| 1797 | 88.833 |
| 1798 | 88.833 |
| 1799 | 88.833 |
| 1800 | 88.833 |
| 1801 | 88.833 |
| 1802 | 88.667 |
| 1803 | 88.833 |
| 1804 | 88.667 |
| 1805 | 88.833 |
| 1806 | 88.833 |
| 1807 | 88.833 |
| 1808 | 88.833 |
| 1809 | 89 |
| 1810 | 89 |
| 1811 | 89.167 |
| 1812 | 89.167 |
| 1813 | 89.5 |
| 1814 | 89.667 |
| 1815 | 89.833 |
| 1816 | 90 |
| 1817 | 90.5 |
| 1818 | 90.5 |
| 1819 | 90.5 |
| 1820 | 90.5 |
| 1821 | 90.5 |
| 1822 | 90.5 |
| 1823 | 90.667 |
| 1824 | 90.833 |
| 1825 | 90.833 |
| 1826 | 90.667 |
| 1827 | 90.833 |
| 1828 | 90.833 |
| 1829 | 91 |
| 1830 | 91 |
| 1831 | 91.167 |
| 1832 | 91.333 |
| 1833 | 91.167 |
| 1834 | 91.167 |
| 1835 | 91 |
| 1836 | 91 |
| 1837 | 91 |
| 1838 | 91 |
| 1839 | 90.667 |
| 1840 | 90.667 |
| 1841 | 90.5 |
| 1842 | 90.5 |
| 1843 | 90.5 |
| 1844 | 90.333 |
| 1845 | 90.333 |
| 1846 | 90.667 |
| 1847 | 90.667 |
| 1848 | 90.667 |
| 1849 | 90.833 |
| 1850 | 91 |
| 1851 | 91 |
| 1852 | 91.5 |
| 1853 | 91.667 |
| 1854 | 92.167 |
| 1855 | 92.333 |
| 1856 | 92.5 |
| 1857 | 92.5 |
| 1858 | 92.5 |
| 1859 | 92.333 |
| 1860 | 92.333 |
| 1861 | 92.667 |
| 1862 | 92.667 |
| 1863 | 93 |
| 1864 | 93 |
| 1865 | 93.833 |
| 1866 | 94.333 |
| 1867 | 94.333 |
| 1868 | 94.5 |
| 1869 | 94.5 |
| 1870 | 94.667 |
| 1871 | 94.833 |
| 1872 | 95 |
| 1873 | 95 |
| 1874 | 95 |
| 1875 | 94.833 |
| 1876 | 94.5 |
| 1877 | 94.5 |
| 1878 | 93.667 |
| 1879 | 93.667 |
| 1880 | 92.5 |
| 1881 | 92.333 |
| 1882 | 91.333 |
| 1883 | 91.167 |
| 1884 | 90.833 |
| 1885 | 90.833 |
| 1886 | 91.167 |
| 1887 | 91.333 |
| 1888 | 91.5 |
| 1889 | 91.667 |
| 1890 | 91.833 |
| 1891 | 91.833 |
| 1892 | 91.5 |
| 1893 | 91.5 |
| 1894 | 91.5 |
| 1895 | 91.5 |
| 1896 | 91.667 |
| 1897 | 91.667 |
| 1898 | 91.833 |
| 1899 | 92.167 |
| 1900 | 92.167 |
| 1901 | 92.333 |
| 1902 | 92.333 |
| 1903 | 92.5 |
| 1904 | 92.5 |
| 1905 | 92.333 |
| 1906 | 92.333 |
| 1907 | 92.167 |
| 1908 | 92.167 |
| 1909 | 91.833 |
| 1910 | 91.833 |
| 1911 | 91.5 |
| 1912 | 91.5 |
| 1913 | 91 |
| 1914 | 90.833 |
| 1915 | 90.667 |
| 1916 | 90.667 |
| 1917 | 90.333 |
| 1918 | 90.333 |
| 1919 | 90.167 |
| 1920 | 90.167 |
| 1921 | 90.333 |
| 1922 | 90.333 |
| 1923 | 90.5 |
| 1924 | 90.667 |
| 1925 | 90.5 |
| 1926 | 90.5 |
| 1927 | 90.667 |
| 1928 | 90.667 |
| 1929 | 90.333 |
| 1930 | 90.333 |
| 1931 | 90.333 |
| 1932 | 90.333 |
| 1933 | 90.167 |
| 1934 | 90.167 |
| 1935 | 90.333 |
| 1936 | 90.5 |
| 1937 | 90.667 |
| 1938 | 90.667 |
| 1939 | 90.5 |
| 1940 | 90.333 |
| 1941 | 90.333 |
| 1942 | 90.167 |
| 1943 | 90.167 |
| 1944 | 90.167 |
| 1945 | 90.167 |
| 1946 | 90.167 |
| 1947 | 90.333 |
| 1948 | 90.333 |
| 1949 | 90.5 |
| 1950 | 90.667 |
| 1951 | 90.833 |
| 1952 | 90.833 |
| 1953 | 91 |
| 1954 | 91 |
| 1955 | 91.167 |
| 1956 | 91.167 |
| 1957 | 91.167 |
| 1958 | 91 |
| 1959 | 91 |
| 1960 | 91.167 |
| 1961 | 91.333 |
| 1962 | 91.333 |
| 1963 | 91.167 |
| 1964 | 91 |
| 1965 | 90.833 |
| 1966 | 90.833 |
| 1967 | 90.667 |
| 1968 | 90.667 |
| 1969 | 90.667 |
| 1970 | 90.5 |
| 1971 | 90.333 |
| 1972 | 90.333 |
| 1973 | 90.333 |
| 1974 | 90.333 |
| 1975 | 90.667 |
| 1976 | 90.833 |
| 1977 | 90.667 |
| 1978 | 90.667 |
| 1979 | 90.667 |
| 1980 | 90.833 |
| 1981 | 90.833 |
| 1982 | 91.167 |
| 1983 | 91 |
| 1984 | 91.167 |
| 1985 | 91.333 |
| 1986 | 91.333 |
| 1987 | 91.333 |
| 1988 | 91.167 |
| 1989 | 91.333 |
| 1990 | 91.333 |
| 1991 | 91.333 |
| 1992 | 91.333 |
| 1993 | 91.333 |
| 1994 | 90.833 |
| 1995 | 90.833 |
| 1996 | 90.5 |
| 1997 | 90.167 |
| 1998 | 90.167 |
| 1999 | 90 |
| 2000 | 90 |
| 2001 | 90 |
| 2002 | 90 |
| 2003 | 89.833 |
| 2004 | 90 |
| 2005 | 90 |
| 2006 | 89.833 |
| 2007 | 90 |
| 2008 | 89.833 |
| 2009 | 90 |
| 2010 | 90 |
| 2011 | 90.167 |
| 2012 | 90.167 |
| 2013 | 90.167 |
| 2014 | 90.167 |
| 2015 | 90.5 |
| 2016 | 90.5 |
| 2017 | 91 |
| 2018 | 91 |
| 2019 | 91.5 |
| 2020 | 91.667 |
| 2021 | 92.167 |
| 2022 | 92.167 |
| 2023 | 92.833 |
| 2024 | 92.833 |
| 2025 | 93.5 |
| 2026 | 93.5 |
| 2027 | 94.167 |
| 2028 | 94.167 |
| 2029 | 94 |
| 2030 | 94 |
| 2031 | 93.667 |
| 2032 | 93.667 |
| 2033 | 93.5 |
| 2034 | 93.5 |
| 2035 | 93.333 |
| 2036 | 93.5 |
| 2037 | 93.5 |
| 2038 | 93.5 |
| 2039 | 93.667 |
| 2040 | 93.667 |
| 2041 | 93.5 |
| 2042 | 93.5 |
| 2043 | 93.5 |
| 2044 | 93.667 |
| 2045 | 93.5 |
| 2046 | 93.5 |
| 2047 | 93.5 |
| 2048 | 93.5 |
| 2049 | 93.5 |
| 2050 | 93.333 |
| 2051 | 93.333 |
| 2052 | 93.5 |
| 2053 | 93.5 |
| 2054 | 93.667 |
| 2055 | 93.667 |
| 2056 | 94 |
| 2057 | 94 |
| 2058 | 93.5 |
| 2059 | 93.5 |
| 2060 | 93.667 |
| 2061 | 93.667 |
| 2062 | 94.167 |
| 2063 | 94.333 |
| 2064 | 95.167 |
| 2065 | 95.167 |
| 2066 | 95.5 |
| 2067 | 95.667 |
| 2068 | 95 |
| 2069 | 94.833 |
| 2070 | 94.667 |
| 2071 | 94.5 |
| 2072 | 94 |
| 2073 | 94 |
| 2074 | 93.5 |
| 2075 | 93.333 |
| 2076 | 93.5 |
| 2077 | 93.5 |
| 2078 | 93.5 |
| 2079 | 93.167 |
| 2080 | 93.167 |
| 2081 | 93.667 |
| 2082 | 93.5 |
| 2083 | 92.667 |
| 2084 | 92.5 |
| 2085 | 92 |
| 2086 | 92.167 |
| 2087 | 92 |
| 2088 | 92 |
| 2089 | 91.5 |
| 2090 | 91.5 |
| 2091 | 91.5 |
| 2092 | 91.333 |
| 2093 | 91.5 |
| 2094 | 91.667 |
| 2095 | 92.333 |
| 2096 | 92.667 |
| 2097 | 93.333 |
| 2098 | 93.333 |
| 2099 | 93.667 |
| 2100 | 93.667 |
| 2101 | 93.333 |
| 2102 | 93.333 |
| 2103 | 93 |
| 2104 | 92.833 |
| 2105 | 92 |
| 2106 | 91.833 |
| 2107 | 91 |
| 2108 | 90.833 |
| 2109 | 90 |
| 2110 | 89.833 |
| 2111 | 89.167 |
| 2112 | 88.5 |
| 2113 | 88.5 |
| 2114 | 88.167 |
| 2115 | 88.167 |
| 2116 | 88.167 |
| 2117 | 88.167 |
| 2118 | 88.167 |
| 2119 | 88.167 |
| 2120 | 88.5 |
| 2121 | 88.5 |
| 2122 | 88.5 |
| 2123 | 88.5 |
| 2124 | 88.833 |
| 2125 | 89.333 |
| 2126 | 89.5 |
| 2127 | 89.667 |
| 2128 | 89.667 |
| 2129 | 89.667 |
| 2130 | 89.667 |
| 2131 | 89.5 |
| 2132 | 89.5 |
| 2133 | 89.333 |
| 2134 | 89.167 |
| 2135 | 89.167 |
| 2136 | 89.167 |
| 2137 | 89.333 |
| 2138 | 89.333 |
| 2139 | 89.5 |
| 2140 | 89.5 |
| 2141 | 89.667 |
| 2142 | 89.667 |
| 2143 | 89.833 |
| 2144 | 89.833 |
| 2145 | 90 |
| 2146 | 90 |
| 2147 | 90 |
| 2148 | 90 |
| 2149 | 90 |
| 2150 | 90 |
| 2151 | 90.167 |
| 2152 | 90.167 |
| 2153 | 90.5 |
| 2154 | 90.5 |
| 2155 | 90.667 |
| 2156 | 90.833 |
| 2157 | 91 |
| 2158 | 91 |
| 2159 | 91 |
| 2160 | 91 |
| 2161 | 90.5 |
| 2162 | 90.5 |
| 2163 | 90.333 |
| 2164 | 90.333 |
| 2165 | 90.167 |
| 2166 | 90.333 |
| 2167 | 90.167 |
| 2168 | 90.167 |
| 2169 | 90.167 |
| 2170 | 90.167 |
| 2171 | 90.5 |
| 2172 | 90.5 |
| 2173 | 90.5 |
| 2174 | 90.833 |
| 2175 | 90.833 |
| 2176 | 91.167 |
| 2177 | 91.167 |
| 2178 | 91.5 |
| 2179 | 91.5 |
| 2180 | 91.833 |
| 2181 | 91.667 |
| 2182 | 91.833 |
| 2183 | 91.833 |
| 2184 | 91.667 |
| 2185 | 91.667 |
| 2186 | 91.333 |
| 2187 | 91.167 |
| 2188 | 90.667 |
| 2189 | 90.667 |
| 2190 | 90.833 |
| 2191 | 90.833 |
| 2192 | 90.667 |
| 2193 | 90.667 |
| 2194 | 91 |
| 2195 | 91 |
| 2196 | 91.167 |
| 2197 | 91.333 |
| 2198 | 91.333 |
| 2199 | 91.5 |
| 2200 | 91.667 |
| 2201 | 91.667 |
| 2202 | 91.833 |
| 2203 | 91.667 |
| 2204 | 91.667 |
| 2205 | 91.667 |
| 2206 | 91.833 |
| 2207 | 91.667 |
| 2208 | 91.667 |
| 2209 | 91.5 |
| 2210 | 91.5 |
| 2211 | 91.333 |
| 2212 | 91.333 |
| 2213 | 91.167 |
| 2214 | 91.167 |
| 2215 | 91.167 |
| 2216 | 91.167 |
| 2217 | 91.167 |
| 2218 | 91 |
| 2219 | 91.167 |
| 2220 | 91.167 |
| 2221 | 91.333 |
| 2222 | 91.333 |
| 2223 | 91.333 |
| 2224 | 91.333 |
| 2225 | 91.333 |
| 2226 | 91.333 |
| 2227 | 91.167 |
| 2228 | 91.333 |
| 2229 | 91 |
| 2230 | 90.833 |
| 2231 | 90.667 |
| 2232 | 90.667 |
| 2233 | 90.5 |
| 2234 | 90.667 |
| 2235 | 90.833 |
| 2236 | 90.833 |
| 2237 | 91 |
| 2238 | 90.833 |
| 2239 | 91 |
| 2240 | 91.167 |
| 2241 | 91.5 |
| 2242 | 91.333 |
| 2243 | 91.167 |
| 2244 | 91.167 |
| 2245 | 91.333 |
| 2246 | 91.667 |
| 2247 | 91.667 |
| 2248 | 91.833 |
| 2249 | 91.833 |
| 2250 | 91.833 |
| 2251 | 91.833 |
| 2252 | 91.833 |
| 2253 | 91.667 |
| 2254 | 91.5 |
| 2255 | 91.333 |
| 2256 | 91.5 |
| 2257 | 91.5 |
| 2258 | 91.167 |
| 2259 | 91.167 |
| 2260 | 90.833 |
| 2261 | 91 |
| 2262 | 90.833 |
| 2263 | 90.833 |
| 2264 | 91 |
| 2265 | 91 |
| 2266 | 90.833 |
| 2267 | 90.833 |
| 2268 | 90.667 |
| 2269 | 90.667 |
| 2270 | 91 |
| 2271 | 90.833 |
| 2272 | 90.833 |
| 2273 | 90.667 |
| 2274 | 90.5 |
| 2275 | 90.5 |
| 2276 | 90.333 |
| 2277 | 90.333 |
| 2278 | 90.5 |
| 2279 | 90.5 |
| 2280 | 90.5 |
| 2281 | 90.667 |
| 2282 | 91.167 |
| 2283 | 91.167 |
| 2284 | 91.333 |
| 2285 | 91.333 |
| 2286 | 91.833 |
| 2287 | 91.833 |
| 2288 | 92.167 |
| 2289 | 92 |
| 2290 | 92.167 |
| 2291 | 92.333 |
| 2292 | 92.333 |
| 2293 | 92.333 |
| 2294 | 92.333 |
| 2295 | 92.333 |
| 2296 | 92.167 |
| 2297 | 92.167 |
| 2298 | 92 |
| 2299 | 92 |
| 2300 | 92 |
| 2301 | 91.833 |
| 2302 | 91.833 |
| 2303 | 91.667 |
| 2304 | 92 |
| 2305 | 92 |
| 2306 | 91.833 |
| 2307 | 91.833 |
| 2308 | 92 |
| 2309 | 92 |
| 2310 | 92.333 |
| 2311 | 92.333 |
| 2312 | 92 |
| 2313 | 92 |
| 2314 | 91.833 |
| 2315 | 91.833 |
| 2316 | 91.833 |
| 2317 | 91.833 |
| 2318 | 91.833 |
| 2319 | 91.667 |
| 2320 | 91.667 |
| 2321 | 91.667 |
| 2322 | 91.333 |
| 2323 | 91.333 |
| 2324 | 91.333 |
| 2325 | 91.333 |
| 2326 | 91.833 |
| 2327 | 92 |
| 2328 | 92.333 |
| 2329 | 92.333 |
| 2330 | 92.667 |
| 2331 | 92.667 |
| 2332 | 92.833 |
| 2333 | 92.833 |
| 2334 | 92.667 |
| 2335 | 92.667 |
| 2336 | 92.333 |
| 2337 | 92.333 |
| 2338 | 92 |
| 2339 | 91.5 |
| 2340 | 91.5 |
| 2341 | 91.167 |
| 2342 | 91 |
| 2343 | 90.667 |
| 2344 | 90.833 |
| 2345 | 91 |
| 2346 | 91 |
| 2347 | 90.833 |
| 2348 | 91 |
| 2349 | 91.167 |
| 2350 | 91.167 |
| 2351 | 91.333 |
| 2352 | 91.167 |
| 2353 | 91.167 |
| 2354 | 91.167 |
| 2355 | 91.333 |
| 2356 | 91.333 |
| 2357 | 91.667 |
| 2358 | 91.833 |
| 2359 | 91.833 |
| 2360 | 91.833 |
| 2361 | 91.667 |
| 2362 | 91.5 |
| 2363 | 91.667 |
| 2364 | 91.667 |
| 2365 | 91.667 |
| 2366 | 91.833 |
| 2367 | 91.833 |
| 2368 | 91.667 |
| 2369 | 91.667 |
| 2370 | 91.5 |
| 2371 | 91.333 |
| 2372 | 91.5 |
| 2373 | 91.5 |
| 2374 | 91.667 |
| 2375 | 91.667 |
| 2376 | 91.833 |
| 2377 | 91.833 |
| 2378 | 91.667 |
| 2379 | 91.667 |
| 2380 | 91.5 |
| 2381 | 91.333 |
| 2382 | 91.333 |
| 2383 | 91 |
| 2384 | 90.833 |
| 2385 | 90.5 |
| 2386 | 90.333 |
| 2387 | 90.167 |
| 2388 | 90 |
| 2389 | 90 |
| 2390 | 90.167 |
| 2391 | 90.167 |
| 2392 | 90.5 |
| 2393 | 90.333 |
| 2394 | 91 |
| 2395 | 91.167 |
| 2396 | 91.5 |
| 2397 | 91.5 |
| 2398 | 92.333 |
| 2399 | 92.667 |
| 2400 | 93.5 |
| 2401 | 94 |
| 2402 | 94.833 |
| 2403 | 95.5 |
| 2404 | 95.5 |
| 2405 | 96 |
| 2406 | 96 |
| 2407 | 96.667 |
| 2408 | 96.667 |
| 2409 | 96.333 |
| 2410 | 96.333 |
| 2411 | 95.5 |
| 2412 | 95.333 |
| 2413 | 94.667 |
| 2414 | 94.667 |
| 2415 | 94.167 |
| 2416 | 94.167 |
| 2417 | 93.5 |
| 2418 | 93.5 |
| 2419 | 92.333 |
| 2420 | 92.167 |
| 2421 | 91.667 |
| 2422 | 91.667 |
| 2423 | 90.833 |
| 2424 | 90.833 |
| 2425 | 90 |
| 2426 | 90 |
| 2427 | 89.833 |
| 2428 | 89.833 |
| 2429 | 89.667 |
| 2430 | 89.667 |
| 2431 | 90.333 |
| 2432 | 90.333 |
| 2433 | 90.833 |
| 2434 | 91 |
| 2435 | 91.667 |
| 2436 | 91.667 |
| 2437 | 91.833 |
| 2438 | 92 |
| 2439 | 91.667 |
| 2440 | 91.667 |
| 2441 | 91.167 |
| 2442 | 91.167 |
| 2443 | 90.5 |
| 2444 | 90.5 |
| 2445 | 90.167 |
| 2446 | 90.167 |
| 2447 | 89.667 |
| 2448 | 89.5 |
| 2449 | 89.167 |
| 2450 | 89 |
| 2451 | 89 |
| 2452 | 88.833 |
| 2453 | 89.167 |
| 2454 | 89.333 |
| 2455 | 89.333 |
| 2456 | 89.667 |
| 2457 | 89.667 |
| 2458 | 90 |
| 2459 | 90.167 |
| 2460 | 90.333 |
| 2461 | 90.5 |
| 2462 | 90.667 |
| 2463 | 90.667 |
| 2464 | 91 |
| 2465 | 91.167 |
| 2466 | 91.333 |
| 2467 | 91.333 |
| 2468 | 91.5 |
| 2469 | 91.5 |
| 2470 | 91.5 |
| 2471 | 91.333 |
| 2472 | 91.333 |
| 2473 | 91.167 |
| 2474 | 91.167 |
| 2475 | 91 |
| 2476 | 91 |
| 2477 | 90.667 |
| 2478 | 90.667 |
| 2479 | 90.5 |
| 2480 | 90.5 |
| 2481 | 90.333 |
| 2482 | 90.333 |
| 2483 | 90.167 |
| 2484 | 90.167 |
| 2485 | 89.833 |
| 2486 | 89.833 |
| 2487 | 90 |
| 2488 | 90 |
| 2489 | 90 |
| 2490 | 90.167 |
| 2491 | 90.5 |
| 2492 | 90.667 |
| 2493 | 91.5 |
| 2494 | 91.667 |
| 2495 | 92.333 |
| 2496 | 92.5 |
| 2497 | 93.333 |
| 2498 | 93.5 |
| 2499 | 94 |
| 2500 | 94 |
| 2501 | 94.333 |
| 2502 | 94.333 |
| 2503 | 93.833 |
| 2504 | 93.667 |
| 2505 | 92.667 |
| 2506 | 92.5 |
| 2507 | 92.167 |
| 2508 | 92 |
| 2509 | 91.667 |
| 2510 | 91.5 |
| 2511 | 91.5 |
| 2512 | 91.333 |
| 2513 | 91.333 |
| 2514 | 91.333 |
| 2515 | 91.333 |
| 2516 | 91.333 |
| 2517 | 91.167 |
| 2518 | 91 |
| 2519 | 91 |
| 2520 | 90.833 |
| 2521 | 90.667 |
| 2522 | 90.667 |
| 2523 | 90.5 |
| 2524 | 90.5 |
| 2525 | 90.167 |
| 2526 | 90.167 |
| 2527 | 90 |
| 2528 | 90 |
| 2529 | 90 |
| 2530 | 89.833 |
| 2531 | 89.833 |
| 2532 | 89.833 |
| 2533 | 89.667 |
| 2534 | 89.667 |
| 2535 | 89.667 |
| 2536 | 89.667 |
| 2537 | 89.667 |
| 2538 | 89.667 |
| 2539 | 89.833 |
| 2540 | 89.833 |
| 2541 | 90 |
| 2542 | 90 |
| 2543 | 90.167 |
| 2544 | 90.333 |
| 2545 | 90.5 |
| 2546 | 90.5 |
| 2547 | 90.333 |
| 2548 | 90.333 |
| 2549 | 90.333 |
| 2550 | 90.333 |
| 2551 | 90.333 |
| 2552 | 90.5 |
| 2553 | 90.5 |
| 2554 | 90.5 |
| 2555 | 90.333 |
| 2556 | 90.333 |
| 2557 | 90.167 |
| 2558 | 90.167 |
| 2559 | 90.333 |
| 2560 | 90.333 |
| 2561 | 90.333 |
| 2562 | 90.333 |
| 2563 | 90.333 |
| 2564 | 90.5 |
| 2565 | 90.333 |
| 2566 | 90.5 |
| 2567 | 90.5 |
| 2568 | 90.333 |
| 2569 | 90.167 |
| 2570 | 90.333 |
| 2571 | 90.333 |
| 2572 | 90.333 |
| 2573 | 90.333 |
| 2574 | 90.333 |
| 2575 | 90.5 |
| 2576 | 90.5 |
| 2577 | 90.667 |
| 2578 | 90.833 |
| 2579 | 90.833 |
| 2580 | 90.833 |
| 2581 | 91 |
| 2582 | 91.333 |
| 2583 | 91.5 |
| 2584 | 92.333 |
| 2585 | 92.333 |
| 2586 | 93 |
| 2587 | 93.167 |
| 2588 | 93.5 |
| 2589 | 93.5 |
| 2590 | 93.5 |
| 2591 | 93.333 |
| 2592 | 92.833 |
| 2593 | 92.833 |
| 2594 | 92.333 |
| 2595 | 92.333 |
| 2596 | 91.667 |
| 2597 | 91.667 |
| 2598 | 91.333 |
| 2599 | 91.333 |
| 2600 | 91.167 |
| 2601 | 91.167 |
| 2602 | 91.167 |
| 2603 | 91 |
| 2604 | 91.167 |
| 2605 | 91 |
| 2606 | 91.167 |
| 2607 | 91.167 |
| 2608 | 91 |
| 2609 | 91 |
| 2610 | 90.833 |
| 2611 | 90.833 |
| 2612 | 90.667 |
| 2613 | 90.5 |
| 2614 | 90.333 |
| 2615 | 90.333 |
| 2616 | 90.167 |
| 2617 | 90 |
| 2618 | 90.167 |
| 2619 | 90.167 |
| 2620 | 90.167 |
| 2621 | 90.167 |
| 2622 | 90.333 |
| 2623 | 90.333 |
| 2624 | 90.5 |
| 2625 | 90.5 |
| 2626 | 90.5 |
| 2627 | 90.5 |
| 2628 | 90.833 |
| 2629 | 91 |
| 2630 | 91.333 |
| 2631 | 91.333 |
| 2632 | 91.5 |
| 2633 | 91.5 |
| 2634 | 91.667 |
| 2635 | 91.667 |
| 2636 | 91.833 |
| 2637 | 91.667 |
| 2638 | 91.667 |
| 2639 | 91.667 |
| 2640 | 91.333 |
| 2641 | 91.333 |
| 2642 | 91.333 |
| 2643 | 91.5 |
| 2644 | 91.333 |
| 2645 | 91.333 |
| 2646 | 91.5 |
| 2647 | 91.5 |
| 2648 | 91.667 |
| 2649 | 91.333 |
| 2650 | 91.333 |
| 2651 | 91.167 |
| 2652 | 91.167 |
| 2653 | 91.333 |
| 2654 | 91.5 |
| 2655 | 91.667 |
| 2656 | 91.667 |
| 2657 | 92 |
| 2658 | 92 |
| 2659 | 92.167 |
| 2660 | 92.167 |
| 2661 | 92.333 |
| 2662 | 92.333 |
| 2663 | 92.167 |
| 2664 | 92 |
| 2665 | 91.667 |
| 2666 | 91.667 |
| 2667 | 91.333 |
| 2668 | 91.333 |
| 2669 | 91.167 |
| 2670 | 91.167 |
| 2671 | 91.167 |
| 2672 | 91 |
| 2673 | 90.833 |
| 2674 | 90.833 |
| 2675 | 90.833 |
| 2676 | 90.833 |
| 2677 | 90.833 |
| 2678 | 90.833 |
| 2679 | 90.833 |
| 2680 | 90.833 |
| 2681 | 90.833 |
| 2682 | 90.833 |
| 2683 | 90.833 |
| 2684 | 91 |
| 2685 | 90.833 |
| 2686 | 90.833 |
| 2687 | 90.833 |
| 2688 | 91 |
| 2689 | 90.833 |
| 2690 | 90.667 |
| 2691 | 90.5 |
| 2692 | 90.5 |
| 2693 | 90.5 |
| 2694 | 90.5 |
| 2695 | 90.5 |
| 2696 | 90.333 |
| 2697 | 90.333 |
| 2698 | 90.333 |
| 2699 | 90.333 |
| 2700 | 90.333 |
| 2701 | 90.333 |
| 2702 | 90.333 |
| 2703 | 90.667 |
| 2704 | 90.667 |
| 2705 | 90.833 |
| 2706 | 90.833 |
| 2707 | 90.667 |
| 2708 | 90.667 |
| 2709 | 90.667 |
| 2710 | 91.167 |
| 2711 | 91.333 |
| 2712 | 92.333 |
| 2713 | 92.833 |
| 2714 | 93.5 |
| 2715 | 93.833 |
| 2716 | 94.167 |
| 2717 | 94.5 |
| 2718 | 95.167 |
| 2719 | 95.5 |
| 2720 | 96 |
| 2721 | 96.333 |
| 2722 | 96.833 |
| 2723 | 97.333 |
| 2724 | 98 |
| 2725 | 97.667 |
| 2726 | 97.5 |
| 2727 | 96.833 |
| 2728 | 96.667 |
| 2729 | 96 |
| 2730 | 95.833 |
| 2731 | 94.333 |
| 2732 | 94.333 |
| 2733 | 94 |
| 2734 | 93.833 |
| 2735 | 92.5 |
| 2736 | 92.333 |
| 2737 | 91.333 |
| 2738 | 91.333 |
| 2739 | 90.667 |
| 2740 | 90.5 |
| 2741 | 90 |
| 2742 | 90 |
| 2743 | 89.667 |
| 2744 | 89.667 |
| 2745 | 89.833 |
| 2746 | 89.833 |
| 2747 | 89.833 |
| 2748 | 89.833 |
| 2749 | 89.833 |
| 2750 | 89.833 |
| 2751 | 90 |
| 2752 | 89.833 |
| 2753 | 89.833 |
| 2754 | 89.5 |
| 2755 | 89.5 |
| 2756 | 89.5 |
| 2757 | 89.5 |
| 2758 | 89.667 |
| 2759 | 89.5 |
| 2760 | 89.667 |
| 2761 | 89.667 |
| 2762 | 89.833 |
| 2763 | 89.833 |
| 2764 | 89.833 |
| 2765 | 90 |
| 2766 | 90 |
| 2767 | 90.167 |
| 2768 | 90.167 |
| 2769 | 90 |
| 2770 | 90 |
| 2771 | 90.167 |
| 2772 | 90.167 |
| 2773 | 90 |
| 2774 | 90 |
| 2775 | 90.167 |
| 2776 | 90.167 |
| 2777 | 89.833 |
| 2778 | 89.833 |
| 2779 | 89.833 |
| 2780 | 89.833 |
| 2781 | 90 |
| 2782 | 90 |
| 2783 | 90.167 |
| 2784 | 90.167 |
| 2785 | 90.5 |
| 2786 | 90.5 |
| 2787 | 91 |
| 2788 | 91 |
| 2789 | 91.167 |
| 2790 | 91.167 |
| 2791 | 91.5 |
| 2792 | 91.667 |
| 2793 | 92 |
| 2794 | 92 |
| 2795 | 92.5 |
| 2796 | 92.667 |
| 2797 | 92.833 |
| 2798 | 92.833 |
| 2799 | 92.667 |
| 2800 | 92.667 |
| 2801 | 92.5 |
| 2802 | 92.5 |
| 2803 | 92.167 |
| 2804 | 92.167 |
| 2805 | 91.833 |
| 2806 | 91.667 |
| 2807 | 91.333 |
| 2808 | 91 |
| 2809 | 90.667 |
| 2810 | 90.5 |
| 2811 | 90.333 |
| 2812 | 90.167 |
| 2813 | 90.167 |
| 2814 | 89.833 |
| 2815 | 89.833 |
| 2816 | 90 |
| 2817 | 90 |
| 2818 | 90.167 |
| 2819 | 90.167 |
| 2820 | 90.5 |
| 2821 | 90.333 |
| 2822 | 90.667 |
| 2823 | 90.667 |
| 2824 | 90.833 |
| 2825 | 90.833 |
| 2826 | 91 |
| 2827 | 90.833 |
| 2828 | 91 |
| 2829 | 90.833 |
| 2830 | 90.833 |
| 2831 | 90.833 |
| 2832 | 91.5 |
| 2833 | 91.5 |
| 2834 | 92.333 |
| 2835 | 92.333 |
| 2836 | 93 |
| 2837 | 93.167 |
| 2838 | 93.333 |
| 2839 | 93.5 |
| 2840 | 93.833 |
| 2841 | 93.833 |
| 2842 | 93.667 |
| 2843 | 93.667 |
| 2844 | 93.333 |
| 2845 | 93.333 |
| 2846 | 93.167 |
| 2847 | 93.167 |
| 2848 | 92.333 |
| 2849 | 92.333 |
| 2850 | 91.667 |
| 2851 | 91.667 |
| 2852 | 91.333 |
| 2853 | 91.333 |
| 2854 | 90.833 |
| 2855 | 91 |
| 2856 | 90.833 |
| 2857 | 90.833 |
| 2858 | 90.833 |
| 2859 | 91 |
| 2860 | 91 |
| 2861 | 91 |
| 2862 | 91 |
| 2863 | 91 |
| 2864 | 91.167 |
| 2865 | 91.667 |
| 2866 | 91.833 |
| 2867 | 92.333 |
| 2868 | 92.333 |
| 2869 | 92 |
| 2870 | 92 |
| 2871 | 91.333 |
| 2872 | 91.333 |
| 2873 | 91.333 |
| 2874 | 91.333 |
| 2875 | 92.333 |
| 2876 | 92.333 |
| 2877 | 93.167 |
| 2878 | 94.167 |
| 2879 | 94.333 |
| 2880 | 94.833 |
| 2881 | 94.833 |
| 2882 | 94.667 |
| 2883 | 94.667 |
| 2884 | 94.333 |
| 2885 | 94.167 |
| 2886 | 93 |
| 2887 | 93 |
| 2888 | 92.167 |
| 2889 | 92 |
| 2890 | 91.167 |
| 2891 | 91 |
| 2892 | 90.667 |
| 2893 | 90.667 |
| 2894 | 90.5 |
| 2895 | 90.333 |
| 2896 | 90.167 |
| 2897 | 90 |
| 2898 | 89.833 |
| 2899 | 89.833 |
| 2900 | 89.833 |
| 2901 | 89.833 |
| 2902 | 89.833 |
| 2903 | 89.833 |
| 2904 | 90 |
| 2905 | 90 |
| 2906 | 90.333 |
| 2907 | 90.167 |
| 2908 | 90.167 |
| 2909 | 90.167 |
| 2910 | 90.167 |
| 2911 | 90.333 |
| 2912 | 90.5 |
| 2913 | 90.667 |
| 2914 | 91 |
| 2915 | 91.167 |
| 2916 | 91.5 |
| 2917 | 91.5 |
| 2918 | 91.667 |
| 2919 | 91.5 |
| 2920 | 91.333 |
| 2921 | 91 |
| 2922 | 91 |
| 2923 | 90.667 |
| 2924 | 90.5 |
| 2925 | 90.167 |
| 2926 | 90.167 |
| 2927 | 89.833 |
| 2928 | 89.833 |
| 2929 | 89.667 |
| 2930 | 89.833 |
| 2931 | 89.833 |
| 2932 | 90 |
| 2933 | 90.333 |
| 2934 | 90 |
| 2935 | 90 |
| 2936 | 89.833 |
| 2937 | 89.833 |
| 2938 | 90.167 |
| 2939 | 90.167 |
| 2940 | 90.667 |
| 2941 | 90.833 |
| 2942 | 91.333 |
| 2943 | 91.333 |
| 2944 | 91.667 |
| 2945 | 91.833 |
| 2946 | 92 |
| 2947 | 92.167 |
| 2948 | 92.167 |
| 2949 | 92.333 |
| 2950 | 92.333 |
| 2951 | 92.167 |
| 2952 | 92 |
| 2953 | 91.167 |
| 2954 | 91 |
| 2955 | 90.5 |
| 2956 | 90.333 |
| 2957 | 90 |
| 2958 | 90 |
| 2959 | 89.667 |
| 2960 | 89.667 |
| 2961 | 89.667 |
| 2962 | 89.5 |
| 2963 | 89.5 |
| 2964 | 89 |
| 2965 | 89 |
| 2966 | 88.667 |
| 2967 | 88.667 |
| 2968 | 88.167 |
| 2969 | 87.833 |
| 2970 | 87.167 |
| 2971 | 87.167 |
| 2972 | 87.167 |
| 2973 | 87.167 |
| 2974 | 87.167 |
| 2975 | 87.167 |
| 2976 | 88 |
| 2977 | 88 |
| 2978 | 88.5 |
| 2979 | 88.5 |
| 2980 | 89.333 |
| 2981 | 89.333 |
| 2982 | 89.833 |
| 2983 | 90 |
| 2984 | 90.667 |
| 2985 | 90.667 |
| 2986 | 91.333 |
| 2987 | 91.667 |
| 2988 | 91.833 |
| 2989 | 92 |
| 2990 | 92 |
| 2991 | 92 |
| 2992 | 92.5 |
| 2993 | 92.667 |
| 2994 | 92.833 |
| 2995 | 93 |
| 2996 | 93 |
| 2997 | 92.833 |
| 2998 | 92.833 |
| 2999 | 93.167 |
| 3000 | 93.333 |
| 3001 | 93.333 |
| 3002 | 93.333 |
| 3003 | 92.833 |
| 3004 | 92.833 |
| 3005 | 92 |
| 3006 | 92 |
| 3007 | 91.333 |
| 3008 | 91.167 |
| 3009 | 90.5 |
| 3010 | 90.5 |
| 3011 | 89.833 |
| 3012 | 89.833 |
| 3013 | 89.667 |
| 3014 | 89.667 |
| 3015 | 89.667 |
| 3016 | 89.833 |
| 3017 | 89.833 |
| 3018 | 89.833 |
| 3019 | 90 |
| 3020 | 90 |
| 3021 | 90.167 |
| 3022 | 90.167 |
| 3023 | 90.333 |
| 3024 | 90.333 |
| 3025 | 90.167 |
| 3026 | 90.333 |
| 3027 | 90.333 |
| 3028 | 90.5 |
| 3029 | 90.5 |
| 3030 | 91.333 |
| 3031 | 91.5 |
| 3032 | 92.833 |
| 3033 | 93 |
| 3034 | 94 |
| 3035 | 94 |
| 3036 | 94.5 |
| 3037 | 94.5 |
| 3038 | 94.667 |
| 3039 | 94.5 |
| 3040 | 93.5 |
| 3041 | 93 |
| 3042 | 93 |
| 3043 | 92.667 |
| 3044 | 92.833 |
| 3045 | 93 |
| 3046 | 92.833 |
| 3047 | 93.667 |
| 3048 | 93.667 |
| 3049 | 94.167 |
| 3050 | 94.167 |
| 3051 | 94.667 |
| 3052 | 94.667 |
| 3053 | 94.667 |
| 3054 | 94.667 |
| 3055 | 94.167 |
| 3056 | 94.167 |
| 3057 | 93.667 |
| 3058 | 93.667 |
| 3059 | 93.333 |
| 3060 | 93.333 |
| 3061 | 93 |
| 3062 | 92.833 |
| 3063 | 92.333 |
| 3064 | 92 |
| 3065 | 91.667 |
| 3066 | 91.333 |
| 3067 | 90.667 |
| 3068 | 90 |
| 3069 | 90 |
| 3070 | 90.167 |
| 3071 | 90 |
| 3072 | 89.667 |
| 3073 | 89.833 |
| 3074 | 89.667 |
| 3075 | 89.667 |
| 3076 | 89.833 |
| 3077 | 89.833 |
| 3078 | 89.667 |
| 3079 | 89.667 |
| 3080 | 90.167 |
| 3081 | 90.167 |
| 3082 | 90.833 |
| 3083 | 91 |
| 3084 | 91.667 |
| 3085 | 91.667 |
| 3086 | 92 |
| 3087 | 92.167 |
| 3088 | 91.833 |
| 3089 | 91.833 |
| 3090 | 91.167 |
| 3091 | 91.167 |
| 3092 | 90.833 |
| 3093 | 90.833 |
| 3094 | 90.333 |
| 3095 | 90.333 |
| 3096 | 90.5 |
| 3097 | 90.5 |
| 3098 | 90.833 |
| 3099 | 90.833 |
| 3100 | 91.167 |
| 3101 | 91.167 |
| 3102 | 91.667 |
| 3103 | 91.833 |
| 3104 | 91.833 |
| 3105 | 91.833 |
| 3106 | 91.833 |
| 3107 | 91.667 |
| 3108 | 91.5 |
| 3109 | 91.5 |
| 3110 | 91.333 |
| 3111 | 91.5 |
| 3112 | 91.167 |
| 3113 | 91.167 |
| 3114 | 91 |
| 3115 | 91 |
| 3116 | 90.833 |
| 3117 | 90.667 |
| 3118 | 90.5 |
| 3119 | 90.5 |
| 3120 | 90.5 |
| 3121 | 90.5 |
| 3122 | 90.667 |
| 3123 | 90.667 |
| 3124 | 90.667 |
| 3125 | 90.5 |
| 3126 | 90.5 |
| 3127 | 90.5 |
| 3128 | 90.333 |
| 3129 | 90.333 |
| 3130 | 90.5 |
| 3131 | 90.667 |
| 3132 | 90.667 |
| 3133 | 91.167 |
| 3134 | 91.167 |
| 3135 | 91.833 |
| 3136 | 92 |
| 3137 | 92.5 |
| 3138 | 92.5 |
| 3139 | 93.167 |
| 3140 | 93.167 |
| 3141 | 93.167 |
| 3142 | 93.167 |
| 3143 | 92.667 |
| 3144 | 92.667 |
| 3145 | 92.5 |
| 3146 | 92.5 |
| 3147 | 92.667 |
| 3148 | 92.5 |
| 3149 | 92.333 |
| 3150 | 92.167 |
| 3151 | 92.167 |
| 3152 | 92.167 |
| 3153 | 92.167 |
| 3154 | 92.167 |
| 3155 | 91.833 |
| 3156 | 91.5 |
| 3157 | 91 |
| 3158 | 91 |
| 3159 | 90.667 |
| 3160 | 90.5 |
| 3161 | 90.333 |
| 3162 | 89.833 |
| 3163 | 89.833 |
| 3164 | 89.667 |
| 3165 | 89.667 |
| 3166 | 89.5 |
| 3167 | 89.5 |
| 3168 | 89.5 |
| 3169 | 89.5 |
| 3170 | 89.5 |
| 3171 | 89.5 |
| 3172 | 89.667 |
| 3173 | 89.667 |
| 3174 | 89.833 |
| 3175 | 90 |
| 3176 | 90.167 |
| 3177 | 90 |
| 3178 | 90 |
| 3179 | 89.833 |
| 3180 | 90 |
| 3181 | 90 |
| 3182 | 89.833 |
| 3183 | 90 |
| 3184 | 90.167 |
| 3185 | 90.167 |
| 3186 | 90.333 |
| 3187 | 90.5 |
| 3188 | 90.667 |
| 3189 | 90.667 |
| 3190 | 91 |
| 3191 | 91.167 |
| 3192 | 91.333 |
| 3193 | 91.333 |
| 3194 | 91.167 |
| 3195 | 91 |
| 3196 | 91.167 |
| 3197 | 91.167 |
| 3198 | 91 |
| 3199 | 90.833 |
| 3200 | 90.833 |
| 3201 | 90.833 |
| 3202 | 90.667 |
| 3203 | 90.667 |
| 3204 | 90.667 |
| 3205 | 90.5 |
| 3206 | 90.5 |
| 3207 | 90.5 |
| 3208 | 90.5 |
| 3209 | 90.667 |
| 3210 | 90.667 |
| 3211 | 91.333 |
| 3212 | 91.333 |
| 3213 | 91.667 |
| 3214 | 91.667 |
| 3215 | 92.167 |
| 3216 | 92.167 |
| 3217 | 92.5 |
| 3218 | 92.5 |
| 3219 | 92.333 |
| 3220 | 92.333 |
| 3221 | 92.333 |
| 3222 | 92.333 |
| 3223 | 92 |
| 3224 | 92 |
| 3225 | 92 |
| 3226 | 92 |
| 3227 | 91.833 |
| 3228 | 91.833 |
| 3229 | 91.833 |
| 3230 | 92 |
| 3231 | 92 |
| 3232 | 91.667 |
| 3233 | 91.667 |
| 3234 | 91.5 |
| 3235 | 91.333 |
| 3236 | 91.167 |
| 3237 | 91 |
| 3238 | 91 |
| 3239 | 91 |
| 3240 | 90.833 |
| 3241 | 90.667 |
| 3242 | 90.5 |
| 3243 | 90.5 |
| 3244 | 90.333 |
| 3245 | 90.333 |
| 3246 | 90.333 |
| 3247 | 90.333 |
| 3248 | 90.333 |
| 3249 | 90.333 |
| 3250 | 90.5 |
| 3251 | 90.5 |
| 3252 | 90.667 |
| 3253 | 90.5 |
| 3254 | 90.5 |
| 3255 | 90.667 |
| 3256 | 90.5 |
| 3257 | 90.5 |
| 3258 | 90.667 |
| 3259 | 90.667 |
| 3260 | 90.833 |
| 3261 | 90.833 |
| 3262 | 91.167 |
| 3263 | 91.167 |
| 3264 | 91.667 |
| 3265 | 91.833 |
| 3266 | 91.833 |
| 3267 | 92 |
| 3268 | 91.833 |
| 3269 | 91.667 |
| 3270 | 91.667 |
| 3271 | 91.833 |
| 3272 | 91.5 |
| 3273 | 91.5 |
| 3274 | 91.333 |
| 3275 | 91.333 |
| 3276 | 91.167 |
| 3277 | 91.333 |
| 3278 | 91.333 |
| 3279 | 91.333 |
| 3280 | 91.5 |
| 3281 | 91.5 |
| 3282 | 92.167 |
| 3283 | 92.167 |
| 3284 | 92.5 |
| 3285 | 92.5 |
| 3286 | 92.667 |
| 3287 | 92.667 |
| 3288 | 92.5 |
| 3289 | 92.5 |
| 3290 | 92.333 |
| 3291 | 92.333 |
| 3292 | 92.333 |
| 3293 | 92.333 |
| 3294 | 92.167 |
| 3295 | 92.333 |
| 3296 | 92.333 |
| 3297 | 92.5 |
| 3298 | 92.833 |
| 3299 | 93 |
| 3300 | 93.667 |
| 3301 | 93.833 |
| 3302 | 94.5 |
| 3303 | 94.5 |
| 3304 | 94.667 |
| 3305 | 94.833 |
| 3306 | 95.333 |
| 3307 | 95.5 |
| 3308 | 94.5 |
| 3309 | 94.167 |
| 3310 | 93 |
| 3311 | 92.667 |
| 3312 | 91.667 |
| 3313 | 91.5 |
| 3314 | 90.833 |
| 3315 | 90.833 |
| 3316 | 90.5 |
| 3317 | 90.667 |
| 3318 | 91.167 |
| 3319 | 91.167 |
| 3320 | 91.667 |
| 3321 | 91.833 |
| 3322 | 92.833 |
| 3323 | 92.833 |
| 3324 | 93.667 |
| 3325 | 93.667 |
| 3326 | 94.667 |
| 3327 | 94.667 |
| 3328 | 94.5 |
| 3329 | 94.5 |
| 3330 | 94 |
| 3331 | 93.833 |
| 3332 | 93.5 |
| 3333 | 93.333 |
| 3334 | 93 |
| 3335 | 92.5 |
| 3336 | 92.5 |
| 3337 | 92.5 |
| 3338 | 92.333 |
| 3339 | 92.167 |
| 3340 | 92.167 |
| 3341 | 92.333 |
| 3342 | 93 |
| 3343 | 93.167 |
| 3344 | 93.5 |
| 3345 | 93.333 |
| 3346 | 93.167 |
| 3347 | 93.167 |
| 3348 | 93.333 |
| 3349 | 93.667 |
| 3350 | 93.667 |
| 3351 | 93.833 |
| 3352 | 93.833 |
| 3353 | 94 |
| 3354 | 94.167 |
| 3355 | 94.167 |
| 3356 | 94 |
| 3357 | 93.833 |
| 3358 | 93.667 |
| 3359 | 93.5 |
| 3360 | 93.5 |
| 3361 | 93.167 |
| 3362 | 93 |
| 3363 | 92.833 |
| 3364 | 92.833 |
| 3365 | 92.5 |
| 3366 | 92.5 |
| 3367 | 91.5 |
| 3368 | 91.5 |
| 3369 | 91 |
| 3370 | 91 |
| 3371 | 90.833 |
| 3372 | 91 |
| 3373 | 90.5 |
| 3374 | 90.5 |
| 3375 | 90 |
| 3376 | 90 |
| 3377 | 89.667 |
| 3378 | 89.5 |
| 3379 | 89.333 |
| 3380 | 89.167 |
| 3381 | 89 |
| 3382 | 89 |
| 3383 | 88.833 |
| 3384 | 88.833 |
| 3385 | 88.167 |
| 3386 | 88 |
| 3387 | 87.667 |
| 3388 | 87.833 |
| 3389 | 87.333 |
| 3390 | 87.167 |
| 3391 | 86.833 |
| 3392 | 86.833 |
| 3393 | 86.667 |
| 3394 | 86.833 |
| 3395 | 87.167 |
| 3396 | 87.167 |
| 3397 | 87.5 |
| 3398 | 87.667 |
| 3399 | 88.167 |
| 3400 | 88.167 |
| 3401 | 88.667 |
| 3402 | 89.167 |
| 3403 | 89.167 |
| 3404 | 89.167 |
| 3405 | 89.167 |
| 3406 | 89.333 |
| 3407 | 89.333 |
| 3408 | 89.5 |
| 3409 | 89.5 |
| 3410 | 89.5 |
| 3411 | 89.5 |
| 3412 | 89.333 |
| 3413 | 89.333 |
| 3414 | 89.667 |
| 3415 | 89.667 |
| 3416 | 89.833 |
| 3417 | 90.333 |
| 3418 | 90.5 |
| 3419 | 91.167 |
| 3420 | 91.333 |
| 3421 | 92 |
| 3422 | 92 |
| 3423 | 92.333 |
| 3424 | 92.333 |
| 3425 | 92 |
| 3426 | 91.833 |
| 3427 | 91.667 |
| 3428 | 91.5 |
| 3429 | 91.333 |
| 3430 | 91.333 |
| 3431 | 91.333 |
| 3432 | 91.167 |
| 3433 | 91 |
| 3434 | 90.833 |
| 3435 | 90.833 |
| 3436 | 91 |
| 3437 | 91.167 |
| 3438 | 91.167 |
| 3439 | 91.333 |
| 3440 | 91.667 |
| 3441 | 91.667 |
| 3442 | 91.833 |
| 3443 | 91.667 |
| 3444 | 91.333 |
| 3445 | 91.167 |
| 3446 | 90.667 |
| 3447 | 90.5 |
| 3448 | 89.833 |
| 3449 | 89.667 |
| 3450 | 89.167 |
| 3451 | 89 |
| 3452 | 88.5 |
| 3453 | 88.333 |
| 3454 | 88.5 |
| 3455 | 88.333 |
| 3456 | 88.5 |
| 3457 | 89.167 |
| 3458 | 89.333 |
| 3459 | 90.333 |
| 3460 | 90.333 |
| 3461 | 90.667 |
| 3462 | 90.667 |
| 3463 | 90.833 |
| 3464 | 90.833 |
| 3465 | 90.833 |
| 3466 | 90.833 |
| 3467 | 90.833 |
| 3468 | 90.833 |
| 3469 | 90.5 |
| 3470 | 90.5 |
| 3471 | 90.333 |
| 3472 | 90.333 |
| 3473 | 90.333 |
| 3474 | 90.333 |
| 3475 | 90.5 |
| 3476 | 90.333 |
| 3477 | 90.5 |
| 3478 | 90.5 |
| 3479 | 90.333 |
| 3480 | 90.333 |
| 3481 | 90.333 |
| 3482 | 90.333 |
| 3483 | 90.5 |
| 3484 | 90.5 |
| 3485 | 90.667 |
| 3486 | 90.667 |
| 3487 | 90.667 |
| 3488 | 90.667 |
| 3489 | 90.667 |
| 3490 | 90.833 |
| 3491 | 90.667 |
| 3492 | 90.667 |
| 3493 | 90.333 |
| 3494 | 90.333 |
| 3495 | 90 |
| 3496 | 90 |
| 3497 | 90.167 |
| 3498 | 90.333 |
| 3499 | 90.333 |
| 3500 | 90.167 |
| 3501 | 90.167 |
| 3502 | 90.167 |
| 3503 | 90.167 |
| 3504 | 90.167 |
| 3505 | 90 |
| 3506 | 90.167 |
| 3507 | 90.5 |
| 3508 | 90.5 |
| 3509 | 90.5 |
| 3510 | 90.5 |
| 3511 | 90.667 |
| 3512 | 90.667 |
| 3513 | 91.5 |
| 3514 | 91.5 |
| 3515 | 92.333 |
| 3516 | 92.333 |
| 3517 | 92.5 |
| 3518 | 92.5 |
| 3519 | 92.5 |
| 3520 | 92.5 |
| 3521 | 92.333 |
| 3522 | 92.333 |
| 3523 | 92.5 |
| 3524 | 92.667 |
| 3525 | 92.5 |
| 3526 | 92.5 |
| 3527 | 92.167 |
| 3528 | 92.167 |
| 3529 | 91.833 |
| 3530 | 91.833 |
| 3531 | 91.5 |
| 3532 | 91.5 |
| 3533 | 91.333 |
| 3534 | 91.5 |
| 3535 | 91.667 |
| 3536 | 91.667 |
| 3537 | 92 |
| 3538 | 91.833 |
| 3539 | 91.833 |
| 3540 | 91.833 |
| 3541 | 91.333 |
| 3542 | 91.333 |
| 3543 | 90.667 |
| 3544 | 90.667 |
| 3545 | 90.5 |
| 3546 | 90.5 |
| 3547 | 90.333 |
| 3548 | 90.333 |
| 3549 | 90.333 |
| 3550 | 90.333 |
| 3551 | 90.167 |
| 3552 | 90.167 |
| 3553 | 90.167 |
| 3554 | 90.167 |
| 3555 | 90.167 |
| 3556 | 90.167 |
| 3557 | 90.5 |
| 3558 | 90.667 |
| 3559 | 90.833 |
| 3560 | 90.833 |
| 3561 | 90.833 |
| 3562 | 90.833 |
| 3563 | 90.5 |
| 3564 | 90.667 |
| 3565 | 90.667 |
| 3566 | 90.667 |
| 3567 | 90.833 |
| 3568 | 90.833 |
| 3569 | 91 |
| 3570 | 91.167 |
| 3571 | 91.333 |
| 3572 | 91.5 |
| 3573 | 91.333 |
| 3574 | 91.667 |
| 3575 | 91.667 |
| 3576 | 92 |
| 3577 | 92 |
| 3578 | 92 |
| 3579 | 92.167 |
| 3580 | 92.167 |
| 3581 | 92.167 |
| 3582 | 92.167 |
| 3583 | 92.167 |
| 3584 | 92.333 |
| 3585 | 92.333 |
| 3586 | 92.333 |
| 3587 | 92.333 |
| 3588 | 92.167 |
| 3589 | 92 |
| 3590 | 91.667 |
| 3591 | 91.667 |
| 3592 | 91.5 |
| 3593 | 91.5 |
| 3594 | 91.333 |
| 3595 | 91.333 |
| 3596 | 91.833 |
| 3597 | 91.833 |
| 3598 | 92.667 |
| 3599 | 92.667 |
| 3600 | 93.667 |
| 3601 | 93.667 |
| 3602 | 93.833 |
| 3603 | 94 |
| 3604 | 94.167 |
| 3605 | 94.167 |
| 3606 | 94.167 |
| 3607 | 94.167 |
| 3608 | 94 |
| 3609 | 94 |
| 3610 | 93.5 |
| 3611 | 93.5 |
| 3612 | 92.5 |
| 3613 | 92.5 |
| 3614 | 91.667 |
| 3615 | 91.667 |
| 3616 | 91.333 |
| 3617 | 91 |
| 3618 | 90.833 |
| 3619 | 90.833 |
| 3620 | 91.167 |
| 3621 | 91.167 |
| 3622 | 91.333 |
| 3623 | 91.333 |
| 3624 | 91.333 |
| 3625 | 91.333 |
| 3626 | 91.333 |
| 3627 | 91.333 |
| 3628 | 91.667 |
| 3629 | 91.5 |
| 3630 | 91.5 |
| 3631 | 91.333 |
| 3632 | 91.333 |
| 3633 | 91.333 |
| 3634 | 91.333 |
| 3635 | 91.333 |
| 3636 | 91.5 |
| 3637 | 91.5 |
| 3638 | 92.167 |
| 3639 | 92.333 |
| 3640 | 92.667 |
| 3641 | 92.667 |
| 3642 | 93 |
| 3643 | 93 |
| 3644 | 93 |
| 3645 | 93 |
| 3646 | 92.833 |
| 3647 | 92.833 |
| 3648 | 92.5 |
| 3649 | 92.333 |
| 3650 | 92 |
| 3651 | 91.5 |
| 3652 | 91.5 |
| 3653 | 91.5 |
| 3654 | 91.5 |
| 3655 | 91.667 |
| 3656 | 91.833 |
| 3657 | 92 |
| 3658 | 91.833 |
| 3659 | 91.667 |
| 3660 | 91.833 |
| 3661 | 91.833 |
| 3662 | 91.833 |
| 3663 | 91.667 |
| 3664 | 91.5 |
| 3665 | 91.333 |
| 3666 | 91.333 |
| 3667 | 91.167 |
| 3668 | 91.167 |
| 3669 | 91 |
| 3670 | 91 |
| 3671 | 90.833 |
| 3672 | 90.833 |
| 3673 | 90.667 |
| 3674 | 90.5 |
| 3675 | 90.5 |
| 3676 | 90.333 |
| 3677 | 90.5 |
| 3678 | 90.333 |
| 3679 | 90.333 |
| 3680 | 90.667 |
| 3681 | 90.667 |
| 3682 | 90.5 |
| 3683 | 90.5 |
| 3684 | 90.5 |
| 3685 | 90.667 |
| 3686 | 90.667 |
| 3687 | 90.667 |
| 3688 | 90.833 |
| 3689 | 91 |
| 3690 | 91.167 |
| 3691 | 91.167 |
| 3692 | 91.333 |
| 3693 | 91.333 |
| 3694 | 91.333 |
| 3695 | 91.5 |
| 3696 | 91.5 |
| 3697 | 91.833 |
| 3698 | 91.833 |
| 3699 | 91.833 |
| 3700 | 92 |
| 3701 | 92.167 |
| 3702 | 92.667 |
| 3703 | 92.667 |
| 3704 | 92.833 |
| 3705 | 92.833 |
| 3706 | 93 |
| 3707 | 93 |
| 3708 | 93.333 |
| 3709 | 93.333 |
| 3710 | 93.333 |
| 3711 | 93.333 |
| 3712 | 93.5 |
| 3713 | 93.5 |
| 3714 | 94 |
| 3715 | 94.167 |
| 3716 | 94.5 |
| 3717 | 94.667 |
| 3718 | 95 |
| 3719 | 95 |
| 3720 | 94.833 |
| 3721 | 94.833 |
| 3722 | 94.667 |
| 3723 | 94.667 |
| 3724 | 94.5 |
| 3725 | 94.333 |
| 3726 | 95.167 |
| 3727 | 95.333 |
| 3728 | 95.667 |
| 3729 | 95.833 |
| 3730 | 95.833 |
| 3731 | 95.833 |
| 3732 | 96.167 |
| 3733 | 96.167 |
| 3734 | 96.667 |
| 3735 | 96.833 |
| 3736 | 97 |
| 3737 | 96.833 |
| 3738 | 96 |
| 3739 | 95.833 |
| 3740 | 94.833 |
| 3741 | 94.5 |
| 3742 | 94 |
| 3743 | 93.5 |
| 3744 | 93.167 |
| 3745 | 92 |
| 3746 | 92 |
| 3747 | 91.5 |
| 3748 | 91.5 |
| 3749 | 91.5 |
| 3750 | 91.5 |
| 3751 | 91.667 |
| 3752 | 91.667 |
| 3753 | 91.667 |
| 3754 | 91.833 |
| 3755 | 91.5 |
| 3756 | 91.5 |
| 3757 | 91.833 |
| 3758 | 91.667 |
| 3759 | 91.333 |
| 3760 | 91.167 |
| 3761 | 90.833 |
| 3762 | 90.667 |
| 3763 | 90.667 |
| 3764 | 90.667 |
| 3765 | 90.5 |
| 3766 | 90.333 |
| 3767 | 90.333 |
| 3768 | 90.333 |
| 3769 | 90.167 |
| 3770 | 90.167 |
| 3771 | 89.833 |
| 3772 | 89.833 |
| 3773 | 89.667 |
| 3774 | 89.333 |
| 3775 | 89.167 |
| 3776 | 89.167 |
| 3777 | 89 |
| 3778 | 89 |
| 3779 | 88.833 |
| 3780 | 88.833 |
| 3781 | 89 |
| 3782 | 89 |
| 3783 | 89 |
| 3784 | 88.833 |
| 3785 | 88.667 |
| 3786 | 88.833 |
| 3787 | 88.5 |
| 3788 | 88.5 |
| 3789 | 88.333 |
| 3790 | 88.333 |
| 3791 | 88.5 |
| 3792 | 88.5 |
| 3793 | 88.5 |
| 3794 | 88.5 |
| 3795 | 88.333 |
| 3796 | 88.333 |
| 3797 | 88.333 |
| 3798 | 88.333 |
| 3799 | 88.5 |
| 3800 | 88.667 |
| 3801 | 89 |
| 3802 | 89 |
| 3803 | 89.333 |
| 3804 | 89.333 |
| 3805 | 89.667 |
| 3806 | 89.667 |
| 3807 | 90 |
| 3808 | 90 |
| 3809 | 90 |
| 3810 | 90 |
| 3811 | 89.833 |
| 3812 | 89.833 |
| 3813 | 89.5 |
| 3814 | 89.5 |
| 3815 | 89 |
| 3816 | 88.833 |
| 3817 | 88.833 |
| 3818 | 88.833 |
| 3819 | 88.667 |
| 3820 | 88.833 |
| 3821 | 89 |
| 3822 | 89 |
| 3823 | 89.333 |
| 3824 | 89.333 |
| 3825 | 89.5 |
| 3826 | 89.667 |
| 3827 | 89.833 |
| 3828 | 89.833 |
| 3829 | 90.167 |
| 3830 | 90.167 |
| 3831 | 90.333 |
| 3832 | 90.5 |
| 3833 | 90.833 |
| 3834 | 90.833 |
| 3835 | 91.5 |
| 3836 | 91.5 |
| 3837 | 92.333 |
| 3838 | 92.333 |
| 3839 | 92.833 |
| 3840 | 92.833 |
| 3841 | 93 |
| 3842 | 93 |
| 3843 | 93.167 |
| 3844 | 93.167 |
| 3845 | 93 |
| 3846 | 92.833 |
| 3847 | 92.833 |
| 3848 | 92.833 |
| 3849 | 92.5 |
| 3850 | 92.5 |
| 3851 | 92.167 |
| 3852 | 92.167 |
| 3853 | 92 |
| 3854 | 91.833 |
| 3855 | 91.667 |
| 3856 | 91.5 |
| 3857 | 91.5 |
| 3858 | 91.333 |
| 3859 | 91.167 |
| 3860 | 90.833 |
| 3861 | 90.833 |
| 3862 | 90.833 |
| 3863 | 90.667 |
| 3864 | 90.833 |
| 3865 | 90.833 |
| 3866 | 90.667 |
| 3867 | 90.667 |
| 3868 | 90.833 |
| 3869 | 90.833 |
| 3870 | 91 |
| 3871 | 91 |
| 3872 | 91.167 |
| 3873 | 91.333 |
| 3874 | 91.333 |
| 3875 | 91.333 |
| 3876 | 91.333 |
| 3877 | 91.333 |
| 3878 | 91.333 |
| 3879 | 91.5 |
| 3880 | 91.667 |
| 3881 | 91.833 |
| 3882 | 91.5 |
| 3883 | 91.667 |
| 3884 | 91.167 |
| 3885 | 91.167 |
| 3886 | 91.167 |
| 3887 | 91.167 |
| 3888 | 90.833 |
| 3889 | 90.833 |
| 3890 | 91.167 |
| 3891 | 91.167 |
| 3892 | 90.833 |
| 3893 | 90.833 |
| 3894 | 90.833 |
| 3895 | 90.833 |
| 3896 | 90.833 |
| 3897 | 90.667 |
| 3898 | 90.5 |
| 3899 | 90.5 |
| 3900 | 90.5 |
| 3901 | 90.333 |
| 3902 | 90.5 |
| 3903 | 90.5 |
| 3904 | 90.667 |
| 3905 | 90.833 |
| 3906 | 90.833 |
| 3907 | 90.833 |
| 3908 | 90.667 |
| 3909 | 90.5 |
| 3910 | 90.5 |
| 3911 | 90.333 |
| 3912 | 90.333 |
| 3913 | 90.333 |
| 3914 | 90.5 |
| 3915 | 90.5 |
| 3916 | 90.833 |
| 3917 | 91.333 |
| 3918 | 91.5 |
| 3919 | 91.833 |
| 3920 | 91.833 |
| 3921 | 91.833 |
| 3922 | 91.667 |
| 3923 | 91.667 |
| 3924 | 91.667 |
| 3925 | 91.5 |
| 3926 | 91.333 |
| 3927 | 91.5 |
| 3928 | 91.5 |
| 3929 | 91.5 |
| 3930 | 91.667 |
| 3931 | 91.833 |
| 3932 | 91.833 |
| 3933 | 92 |
| 3934 | 92 |
| 3935 | 92 |
| 3936 | 91.833 |
| 3937 | 91.833 |
| 3938 | 91.833 |
| 3939 | 92 |
| 3940 | 92 |
| 3941 | 92.333 |
| 3942 | 92.333 |
| 3943 | 92.333 |
| 3944 | 92.167 |
| 3945 | 91.833 |
| 3946 | 91.833 |
| 3947 | 91.667 |
| 3948 | 91.667 |
| 3949 | 91.5 |
| 3950 | 91.5 |
| 3951 | 92 |
| 3952 | 92 |
| 3953 | 92.333 |
| 3954 | 92.333 |
| 3955 | 93 |
| 3956 | 93 |
| 3957 | 93.5 |
| 3958 | 93.833 |
| 3959 | 94.333 |
| 3960 | 94.667 |
| 3961 | 95 |
| 3962 | 95.167 |
| 3963 | 95.667 |
| 3964 | 95.833 |
| 3965 | 96.167 |
| 3966 | 96.5 |
| 3967 | 96.5 |
| 3968 | 96.667 |
| 3969 | 96.833 |
| 3970 | 96.833 |
| 3971 | 96.667 |
| 3972 | 96.333 |
| 3973 | 95.833 |
| 3974 | 95.667 |
| 3975 | 95 |
| 3976 | 94.833 |
| 3977 | 93.667 |
| 3978 | 93.5 |
| 3979 | 93 |
| 3980 | 92.833 |
| 3981 | 92.333 |
| 3982 | 92.167 |
| 3983 | 91.5 |
| 3984 | 91.5 |
| 3985 | 90.667 |
| 3986 | 90.667 |
| 3987 | 89.667 |
| 3988 | 89.667 |
| 3989 | 89 |
| 3990 | 89 |
| 3991 | 88.833 |
| 3992 | 88.833 |
| 3993 | 89.333 |
| 3994 | 89.333 |
| 3995 | 89.833 |
| 3996 | 90 |
| 3997 | 90.5 |
| 3998 | 90.667 |
| 3999 | 91 |
| 4000 | 91.167 |
| 4001 | 91.833 |
| 4002 | 91.833 |
| 4003 | 92.333 |
| 4004 | 92.333 |
| 4005 | 92.667 |
| 4006 | 92.667 |
| 4007 | 93 |
| 4008 | 93 |
| 4009 | 93 |
| 4010 | 93 |
| 4011 | 93.167 |
| 4012 | 93.167 |
| 4013 | 93.167 |
| 4014 | 93.167 |
| 4015 | 92.667 |
| 4016 | 92.667 |
| 4017 | 92.333 |
| 4018 | 92.333 |
| 4019 | 92.833 |
| 4020 | 93.167 |
| 4021 | 93.333 |
| 4022 | 93.333 |
| 4023 | 93 |
| 4024 | 92.667 |
| 4025 | 92 |
| 4026 | 92.167 |
| 4027 | 91.333 |
| 4028 | 91.167 |
| 4029 | 90.333 |
| 4030 | 90.167 |
| 4031 | 89.667 |
| 4032 | 89.5 |
| 4033 | 89.333 |
| 4034 | 89.333 |
| 4035 | 89.167 |
| 4036 | 89.167 |
| 4037 | 89.333 |
| 4038 | 89.333 |
| 4039 | 89.5 |
| 4040 | 89.333 |
| 4041 | 89.167 |
| 4042 | 89.333 |
| 4043 | 89 |
| 4044 | 89 |
| 4045 | 89.167 |
| 4046 | 89.167 |
| 4047 | 89 |
| 4048 | 89 |
| 4049 | 89.167 |
| 4050 | 89.167 |
| 4051 | 89.167 |
| 4052 | 89 |
| 4053 | 89.167 |
| 4054 | 89.167 |
| 4055 | 89 |
| 4056 | 89 |
| 4057 | 88.833 |
| 4058 | 88.833 |
| 4059 | 88.833 |
| 4060 | 89 |
| 4061 | 89 |
| 4062 | 89 |
| 4063 | 89.167 |
| 4064 | 89.167 |
| 4065 | 89.167 |
| 4066 | 89.333 |
| 4067 | 89.167 |
| 4068 | 89.5 |
| 4069 | 89.333 |
| 4070 | 89.667 |
| 4071 | 89.667 |
| 4072 | 89.667 |
| 4073 | 89.667 |
| 4074 | 89.667 |
| 4075 | 89.667 |
| 4076 | 89.667 |
| 4077 | 89.833 |
| 4078 | 89.833 |
| 4079 | 90.167 |
| 4080 | 90.167 |
| 4081 | 90.333 |
| 4082 | 90.333 |
| 4083 | 90.667 |
| 4084 | 90.833 |
| 4085 | 90.833 |
| 4086 | 90.667 |
| 4087 | 90.667 |
| 4088 | 90.667 |
| 4089 | 91 |
| 4090 | 91 |
| 4091 | 91 |
| 4092 | 91 |
| 4093 | 91.5 |
| 4094 | 91.5 |
| 4095 | 92 |
| 4096 | 92 |
| 4097 | 92.667 |
| 4098 | 92.667 |
| 4099 | 93 |
| 4100 | 93.167 |
| 4101 | 93.667 |
| 4102 | 93.667 |
| 4103 | 94 |
| 4104 | 94 |
| 4105 | 94.333 |
| 4106 | 94.333 |
| 4107 | 94.167 |
| 4108 | 94 |
| 4109 | 94.167 |
| 4110 | 94.167 |
| 4111 | 94.167 |
| 4112 | 94.333 |
| 4113 | 93.833 |
| 4114 | 93.833 |
| 4115 | 93.167 |
| 4116 | 93 |
| 4117 | 92.5 |
| 4118 | 92.5 |
| 4119 | 91.5 |
| 4120 | 91.5 |
| 4121 | 91.167 |
| 4122 | 91 |
| 4123 | 90.667 |
| 4124 | 90.833 |
| 4125 | 90.833 |
| 4126 | 91.167 |
| 4127 | 91.167 |
| 4128 | 91.5 |
| 4129 | 91.667 |
| 4130 | 92.5 |
| 4131 | 92.667 |
| 4132 | 93.5 |
| 4133 | 93.5 |
| 4134 | 93.167 |
| 4135 | 93.167 |
| 4136 | 92.833 |
| 4137 | 92.833 |
| 4138 | 92.667 |
| 4139 | 92.667 |
| 4140 | 92.667 |
| 4141 | 92.5 |
| 4142 | 92.167 |
| 4143 | 91.833 |
| 4144 | 91.333 |
| 4145 | 91.167 |
| 4146 | 90.833 |
| 4147 | 90.833 |
| 4148 | 91 |
| 4149 | 91.167 |
| 4150 | 90.833 |
| 4151 | 90.667 |
| 4152 | 90.5 |
| 4153 | 90.167 |
| 4154 | 90 |
| 4155 | 90.5 |
| 4156 | 90.5 |
| 4157 | 91.167 |
| 4158 | 91.167 |
| 4159 | 92 |
| 4160 | 92.167 |
| 4161 | 93.333 |
| 4162 | 93.5 |
| 4163 | 93.833 |
| 4164 | 93.667 |
| 4165 | 93.667 |
| 4166 | 93.667 |
| 4167 | 93.5 |
| 4168 | 93.667 |
| 4169 | 93.667 |
| 4170 | 93.667 |
| 4171 | 93.667 |
| 4172 | 93.5 |
| 4173 | 93.5 |
| 4174 | 93.5 |
| 4175 | 93 |
| 4176 | 92.833 |
| 4177 | 92.333 |
| 4178 | 92.333 |
| 4179 | 91.5 |
| 4180 | 91.5 |
| 4181 | 91.167 |
| 4182 | 91.167 |
| 4183 | 91.167 |
| 4184 | 91.167 |
| 4185 | 91.5 |
| 4186 | 91.5 |
| 4187 | 91.5 |
| 4188 | 91.5 |
| 4189 | 91.833 |
| 4190 | 91.833 |
| 4191 | 92 |
| 4192 | 92 |
| 4193 | 92.167 |
| 4194 | 92.5 |
| 4195 | 92.5 |
| 4196 | 92.333 |
| 4197 | 91.833 |
| 4198 | 91.833 |
| 4199 | 91.167 |
| 4200 | 91.167 |
| 4201 | 90.667 |
| 4202 | 90.5 |
| 4203 | 90 |
| 4204 | 90 |
| 4205 | 89.667 |
| 4206 | 89.5 |
| 4207 | 89.5 |
| 4208 | 89.833 |
| 4209 | 89.833 |
| 4210 | 90 |
| 4211 | 90 |
| 4212 | 90.167 |
| 4213 | 90.333 |
| 4214 | 91.333 |
| 4215 | 91.833 |
| 4216 | 93.333 |
| 4217 | 93.667 |
| 4218 | 95 |
| 4219 | 95 |
| 4220 | 96 |
| 4221 | 96.167 |
| 4222 | 97 |
| 4223 | 97.167 |
| 4224 | 97.167 |
| 4225 | 97.333 |
| 4226 | 97.5 |
| 4227 | 97.667 |
| 4228 | 97.833 |
| 4229 | 97.833 |
| 4230 | 98 |
| 4231 | 98 |
| 4232 | 98 |
| 4233 | 98 |
| 4234 | 98.167 |
| 4235 | 98.167 |
| 4236 | 98 |
| 4237 | 97.833 |
| 4238 | 97.833 |
| 4239 | 97.833 |
| 4240 | 97.833 |
| 4241 | 97.833 |
| 4242 | 97.833 |
| 4243 | 97.833 |
| 4244 | 98 |
| 4245 | 98 |
| 4246 | 98.5 |
| 4247 | 98.5 |
| 4248 | 99.667 |
| 4249 | 99.833 |
| 4250 | 100.667 |
| 4251 | 100.833 |
| 4252 | 102 |
| 4253 | 102.167 |
| 4254 | 102.667 |
| 4255 | 102.833 |
| 4256 | 103.333 |
| 4257 | 103.333 |
| 4258 | 104 |
| 4259 | 104 |
| 4260 | 104.5 |
| 4261 | 104.5 |
| 4262 | 105 |
| 4263 | 105 |
| 4264 | 105.667 |
| 4265 | 105.833 |
| 4266 | 105.667 |
| 4267 | 105.667 |
| 4268 | 105 |
| 4269 | 105 |
| 4270 | 104 |
| 4271 | 103.833 |
| 4272 | 102.833 |
| 4273 | 102.667 |
| 4274 | 101.5 |
| 4275 | 101.333 |
| 4276 | 100.5 |
| 4277 | 100.333 |
| 4278 | 99.5 |
| 4279 | 99.5 |
| 4280 | 99.167 |
| 4281 | 99.167 |
| 4282 | 99.333 |
| 4283 | 99.5 |
| 4284 | 99.667 |
| 4285 | 99.667 |
| 4286 | 99.833 |
| 4287 | 99.833 |
| 4288 | 99.833 |
| 4289 | 99.667 |
| 4290 | 99.667 |
| 4291 | 99.667 |
| 4292 | 99.667 |
| 4293 | 99.667 |
| 4294 | 99.667 |
| 4295 | 99.667 |
| 4296 | 99.167 |
| 4297 | 99.167 |
| 4298 | 98.833 |
| 4299 | 98.667 |
| 4300 | 98.5 |
| 4301 | 98.333 |
| 4302 | 98 |
| 4303 | 98 |
| 4304 | 97.5 |
| 4305 | 97.5 |
| 4306 | 97.167 |
| 4307 | 97.167 |
| 4308 | 97.167 |
| 4309 | 97.167 |
| 4310 | 97.167 |
| 4311 | 97 |
| 4312 | 97.167 |
| 4313 | 97 |
| 4314 | 97 |
| 4315 | 96.833 |
| 4316 | 96.833 |
| 4317 | 96.833 |
| 4318 | 96.833 |
| 4319 | 97 |
| 4320 | 97.167 |
| 4321 | 97.333 |
| 4322 | 97.333 |
| 4323 | 97.833 |
| 4324 | 98.667 |
| 4325 | 98.667 |
| 4326 | 99.333 |
| 4327 | 99.333 |
| 4328 | 99.5 |
| 4329 | 99.667 |
| 4330 | 99.5 |
| 4331 | 99.667 |
| 4332 | 99.333 |
| 4333 | 99 |
| 4334 | 99 |
| 4335 | 99 |
| 4336 | 98.667 |
| 4337 | 98.667 |
| 4338 | 98.333 |
| 4339 | 98.167 |
| 4340 | 97.833 |
| 4341 | 97.833 |
| 4342 | 97.5 |
| 4343 | 97.5 |
| 4344 | 97.5 |
| 4345 | 97.5 |
| 4346 | 97.5 |
| 4347 | 97.5 |
| 4348 | 97.667 |
| 4349 | 97.667 |
| 4350 | 98 |
| 4351 | 98 |
| 4352 | 98.167 |
| 4353 | 98 |
| 4354 | 98.333 |
| 4355 | 98.333 |
| 4356 | 98.5 |
| 4357 | 98.667 |
| 4358 | 98.667 |
| 4359 | 98.667 |
| 4360 | 99 |
| 4361 | 99.5 |
| 4362 | 99.667 |
| 4363 | 100 |
| 4364 | 100 |
| 4365 | 100.333 |
| 4366 | 100.333 |
| 4367 | 100.333 |
| 4368 | 100.5 |
| 4369 | 100.167 |
| 4370 | 100.333 |
| 4371 | 100.167 |
| 4372 | 100.167 |
| 4373 | 100.167 |
| 4374 | 100.167 |
| 4375 | 100.333 |
| 4376 | 100.333 |
| 4377 | 100.167 |
| 4378 | 100 |
| 4379 | 100.167 |
| 4380 | 100.667 |
| 4381 | 100.833 |
| 4382 | 101.5 |
| 4383 | 101.667 |
| 4384 | 102.333 |
| 4385 | 102.5 |
| 4386 | 103 |
| 4387 | 103.333 |
| 4388 | 103.833 |
| 4389 | 103.833 |
| 4390 | 104 |
| 4391 | 104 |
| 4392 | 104 |
| 4393 | 103.667 |
| 4394 | 103.667 |
| 4395 | 103.667 |
| 4396 | 103.667 |
| 4397 | 104 |
| 4398 | 104 |
| 4399 | 104.333 |
| 4400 | 104.333 |
| 4401 | 104.667 |
| 4402 | 104.667 |
| 4403 | 105 |
| 4404 | 104.833 |
| 4405 | 104 |
| 4406 | 104 |
| 4407 | 103.5 |
| 4408 | 103.5 |
| 4409 | 103.167 |
| 4410 | 103.167 |
| 4411 | 102.333 |
| 4412 | 102.333 |
| 4413 | 101.333 |
| 4414 | 101.167 |
| 4415 | 99.833 |
| 4416 | 99.833 |
| 4417 | 98.5 |
| 4418 | 98.5 |
| 4419 | 97.667 |
| 4420 | 97.667 |
| 4421 | 97.167 |
| 4422 | 97.167 |
| 4423 | 97 |
| 4424 | 97 |
| 4425 | 96.833 |
| 4426 | 96.833 |
| 4427 | 96.833 |
| 4428 | 96.833 |
| 4429 | 96.833 |
| 4430 | 96.833 |
| 4431 | 97 |
| 4432 | 97 |
| 4433 | 97.167 |
| 4434 | 97.167 |
| 4435 | 97.167 |
| 4436 | 97 |
| 4437 | 97.167 |
| 4438 | 97.5 |
| 4439 | 97.667 |
| 4440 | 98 |
| 4441 | 98 |
| 4442 | 98.5 |
| 4443 | 98.667 |
| 4444 | 98.833 |
| 4445 | 98.833 |
| 4446 | 99 |
| 4447 | 99.167 |
| 4448 | 99.333 |
| 4449 | 99.333 |
| 4450 | 99.667 |
| 4451 | 99.667 |
| 4452 | 100 |
| 4453 | 100 |
| 4454 | 100.167 |
| 4455 | 100.167 |
| 4456 | 100.167 |
| 4457 | 100.167 |
| 4458 | 100.5 |
| 4459 | 100.5 |
| 4460 | 100.5 |
| 4461 | 100.5 |
| 4462 | 100.667 |
| 4463 | 100.667 |
| 4464 | 101 |
| 4465 | 101 |
| 4466 | 101.333 |
| 4467 | 101.333 |
| 4468 | 101.833 |
| 4469 | 102 |
| 4470 | 102.333 |
| 4471 | 102.333 |
| 4472 | 102.667 |
| 4473 | 103 |
| 4474 | 103 |
| 4475 | 103.333 |
| 4476 | 103.5 |
| 4477 | 103.5 |
| 4478 | 103.5 |
| 4479 | 103.5 |
| 4480 | 103.333 |
| 4481 | 103.5 |
| 4482 | 103.667 |
| 4483 | 103.833 |
| 4484 | 103.833 |
| 4485 | 103.667 |
| 4486 | 103.667 |
| 4487 | 103.333 |
| 4488 | 103.333 |
| 4489 | 103 |
| 4490 | 102.833 |
| 4491 | 102.5 |
| 4492 | 102.667 |
| 4493 | 102 |
| 4494 | 102 |
| 4495 | 101.333 |
| 4496 | 101.333 |
| 4497 | 101.167 |
| 4498 | 101.167 |
| 4499 | 101 |
| 4500 | 101 |
| 4501 | 100.833 |
| 4502 | 100.833 |
| 4503 | 100.833 |
| 4504 | 100.833 |
| 4505 | 100.5 |
| 4506 | 100.5 |
| 4507 | 100.167 |
| 4508 | 100.167 |
| 4509 | 99.833 |
| 4510 | 99.833 |
| 4511 | 99.833 |
| 4512 | 99.833 |
| 4513 | 99.667 |
| 4514 | 99.833 |
| 4515 | 100 |
| 4516 | 100 |
| 4517 | 100.333 |
| 4518 | 100.333 |
| 4519 | 100.333 |
| 4520 | 100.333 |
| 4521 | 100 |
| 4522 | 99.833 |
| 4523 | 99.333 |
| 4524 | 99.333 |
| 4525 | 98.833 |
| 4526 | 98.833 |
| 4527 | 98.167 |
| 4528 | 98.333 |
| 4529 | 97.5 |
| 4530 | 97.5 |
| 4531 | 97.167 |
| 4532 | 97.167 |
| 4533 | 97 |
| 4534 | 97 |
| 4535 | 96.833 |
| 4536 | 96.833 |
| 4537 | 96.667 |
| 4538 | 96.667 |
| 4539 | 96.833 |
| 4540 | 97 |
| 4541 | 97.333 |
| 4542 | 97.5 |
| 4543 | 98.167 |
| 4544 | 98 |
| 4545 | 98.833 |
| 4546 | 98.833 |
| 4547 | 100.167 |
| 4548 | 100.333 |
| 4549 | 100.833 |
| 4550 | 101.167 |
| 4551 | 101.833 |
| 4552 | 102 |
| 4553 | 102.167 |
| 4554 | 102.333 |
| 4555 | 102.333 |
| 4556 | 102.5 |
| 4557 | 102.333 |
| 4558 | 102.333 |
| 4559 | 102 |
| 4560 | 101.833 |
| 4561 | 100.667 |
| 4562 | 100.667 |
| 4563 | 100.167 |
| 4564 | 100 |
| 4565 | 99.667 |
| 4566 | 99.667 |
| 4567 | 99.333 |
| 4568 | 99.333 |
| 4569 | 99.333 |
| 4570 | 99.167 |
| 4571 | 98.833 |
| 4572 | 98.667 |
| 4573 | 98.833 |
| 4574 | 98.833 |
| 4575 | 99 |
| 4576 | 99.167 |
| 4577 | 99.667 |
| 4578 | 99.667 |
| 4579 | 99.833 |
| 4580 | 99.833 |
| 4581 | 100.167 |
| 4582 | 100.167 |
| 4583 | 100.167 |
| 4584 | 100.167 |
| 4585 | 100.167 |
| 4586 | 100.167 |
| 4587 | 100.167 |
| 4588 | 100 |
| 4589 | 99.833 |
| 4590 | 99.833 |
| 4591 | 100 |
| 4592 | 100 |
| 4593 | 100.5 |
| 4594 | 100.5 |
| 4595 | 101.5 |
| 4596 | 101.5 |
| 4597 | 102 |
| 4598 | 102.167 |
| 4599 | 102.833 |
| 4600 | 102.833 |
| 4601 | 103 |
| 4602 | 103 |
| 4603 | 102.5 |
| 4604 | 102.5 |
| 4605 | 102.167 |
| 4606 | 102 |
| 4607 | 101.833 |
| 4608 | 101.833 |
| 4609 | 102.167 |
| 4610 | 102.167 |
| 4611 | 102.667 |
| 4612 | 102.5 |
| 4613 | 102.667 |
| 4614 | 102.667 |
| 4615 | 103 |
| 4616 | 103 |
| 4617 | 103 |
| 4618 | 103 |
| 4619 | 102.5 |
| 4620 | 102.333 |
| 4621 | 101.333 |
| 4622 | 101.167 |
| 4623 | 100.167 |
| 4624 | 100.167 |
| 4625 | 99 |
| 4626 | 99 |
| 4627 | 98 |
| 4628 | 98 |
| 4629 | 97.333 |
| 4630 | 97.333 |
| 4631 | 96.833 |
| 4632 | 96.833 |
| 4633 | 96.833 |
| 4634 | 96.833 |
| 4635 | 96.833 |
| 4636 | 96.833 |
| 4637 | 97 |
| 4638 | 97 |
| 4639 | 97.167 |
| 4640 | 97.333 |
| 4641 | 97.667 |
| 4642 | 97.667 |
| 4643 | 98.167 |
| 4644 | 98.167 |
| 4645 | 98.833 |
| 4646 | 98.833 |
| 4647 | 99.5 |
| 4648 | 99.5 |
| 4649 | 100.167 |
| 4650 | 100.167 |
| 4651 | 100.667 |
| 4652 | 100.833 |
| 4653 | 101.167 |
| 4654 | 101 |
| 4655 | 100.833 |
| 4656 | 100.833 |
| 4657 | 100.667 |
| 4658 | 100.667 |
| 4659 | 100.167 |
| 4660 | 100.167 |
| 4661 | 100.167 |
| 4662 | 100.167 |
| 4663 | 100 |
| 4664 | 99.833 |
| 4665 | 99.833 |
| 4666 | 100 |
| 4667 | 100.333 |
| 4668 | 100.333 |
| 4669 | 100.5 |
| 4670 | 100.5 |
| 4671 | 100.5 |
| 4672 | 100.5 |
| 4673 | 100 |
| 4674 | 99.833 |
| 4675 | 98.833 |
| 4676 | 98.667 |
| 4677 | 98 |
| 4678 | 97.833 |
| 4679 | 97.667 |
| 4680 | 97.833 |
| 4681 | 97.667 |
| 4682 | 97.667 |
| 4683 | 97.833 |
| 4684 | 97.667 |
| 4685 | 98.167 |
| 4686 | 98.167 |
| 4687 | 98.333 |
| 4688 | 98.333 |
| 4689 | 98.667 |
| 4690 | 98.667 |
| 4691 | 98.5 |
| 4692 | 98.5 |
| 4693 | 98.5 |
| 4694 | 98.5 |
| 4695 | 98.5 |
| 4696 | 98.5 |
| 4697 | 98.667 |
| 4698 | 98.667 |
| 4699 | 98.5 |
| 4700 | 98.5 |
| 4701 | 98.5 |
| 4702 | 98.167 |
| 4703 | 98 |
| 4704 | 97.333 |
| 4705 | 97.333 |
| 4706 | 97.167 |
| 4707 | 97.167 |
| 4708 | 97.333 |
| 4709 | 97.333 |
| 4710 | 97.5 |
| 4711 | 97.833 |
| 4712 | 98.333 |
| 4713 | 98.333 |
| 4714 | 98.667 |
| 4715 | 98.667 |
| 4716 | 99.333 |
| 4717 | 99.333 |
| 4718 | 99.167 |
| 4719 | 99 |
| 4720 | 98.667 |
| 4721 | 98.667 |
| 4722 | 98.667 |
| 4723 | 98.667 |
| 4724 | 98.667 |
| 4725 | 98.667 |
| 4726 | 99.167 |
| 4727 | 99.333 |
| 4728 | 99.833 |
| 4729 | 100.167 |
| 4730 | 100.5 |
| 4731 | 101 |
| 4732 | 101.167 |
| 4733 | 101.833 |
| 4734 | 102 |
| 4735 | 102.667 |
| 4736 | 102.833 |
| 4737 | 103.333 |
| 4738 | 103.5 |
| 4739 | 104 |
| 4740 | 104 |
| 4741 | 104.167 |
| 4742 | 104.333 |
| 4743 | 104.5 |
| 4744 | 104.333 |
| 4745 | 104.333 |
| 4746 | 104 |
| 4747 | 104 |
| 4748 | 103.667 |
| 4749 | 103.5 |
| 4750 | 103.167 |
| 4751 | 103.167 |
| 4752 | 102.833 |
| 4753 | 102.833 |
| 4754 | 102.5 |
| 4755 | 102.5 |
| 4756 | 102 |
| 4757 | 102 |
| 4758 | 101.5 |
| 4759 | 101.5 |
| 4760 | 100.667 |
| 4761 | 100.667 |
| 4762 | 100.833 |
| 4763 | 100.833 |
| 4764 | 99.667 |
| 4765 | 99.5 |
| 4766 | 98.333 |
| 4767 | 98.167 |
| 4768 | 97.167 |
| 4769 | 97.167 |
| 4770 | 96.5 |
| 4771 | 96.5 |
| 4772 | 96.167 |
| 4773 | 96.167 |
| 4774 | 96.5 |
| 4775 | 96.667 |
| 4776 | 97.667 |
| 4777 | 97.833 |
| 4778 | 99 |
| 4779 | 99 |
| 4780 | 100 |
| 4781 | 100.167 |
| 4782 | 100.833 |
| 4783 | 100.833 |
| 4784 | 101.667 |
| 4785 | 101.5 |
| 4786 | 101.167 |
| 4787 | 101.167 |
| 4788 | 101 |
| 4789 | 101 |
| 4790 | 100.833 |
| 4791 | 100.833 |
| 4792 | 100.333 |
| 4793 | 100.167 |
| 4794 | 100 |
| 4795 | 100 |
| 4796 | 99.667 |
| 4797 | 99.667 |
| 4798 | 99.5 |
| 4799 | 99.333 |
| 4800 | 99 |
| 4801 | 99 |
| 4802 | 99 |
| 4803 | 99 |
| 4804 | 99.167 |
| 4805 | 99.167 |
| 4806 | 99.333 |
| 4807 | 99.5 |
| 4808 | 99.333 |
| 4809 | 99.333 |
| 4810 | 99.333 |
| 4811 | 99.333 |
| 4812 | 99.333 |
| 4813 | 98.833 |
| 4814 | 98.667 |
| 4815 | 98.333 |
| 4816 | 98.333 |
| 4817 | 98 |
| 4818 | 98 |
| 4819 | 97.667 |
| 4820 | 97.667 |
| 4821 | 97.667 |
| 4822 | 97.667 |
| 4823 | 97.833 |
| 4824 | 97.833 |
| 4825 | 97.833 |
| 4826 | 97.833 |
| 4827 | 98.167 |
| 4828 | 98.333 |
| 4829 | 98.5 |
| 4830 | 98.5 |
| 4831 | 98.667 |
| 4832 | 98.5 |
| 4833 | 98.5 |
| 4834 | 98.5 |
| 4835 | 98.5 |
| 4836 | 98.5 |
| 4837 | 98.167 |
| 4838 | 98 |
| 4839 | 98.167 |
| 4840 | 98.333 |
| 4841 | 98.5 |
| 4842 | 98.5 |
| 4843 | 99.167 |
| 4844 | 99.333 |
| 4845 | 99.833 |
| 4846 | 100 |
| 4847 | 100.667 |
| 4848 | 100.667 |
| 4849 | 101.167 |
| 4850 | 101.167 |
| 4851 | 101.5 |
| 4852 | 101.333 |
| 4853 | 101.167 |
| 4854 | 101.167 |
| 4855 | 100.667 |
| 4856 | 100.667 |
| 4857 | 99.833 |
| 4858 | 99.667 |
| 4859 | 99.167 |
| 4860 | 99 |
| 4861 | 98.833 |
| 4862 | 98.833 |
| 4863 | 99 |
| 4864 | 99 |
| 4865 | 99.167 |
| 4866 | 99.167 |
| 4867 | 99.167 |
| 4868 | 99.167 |
| 4869 | 99.167 |
| 4870 | 99 |
| 4871 | 98.667 |
| 4872 | 98.667 |
| 4873 | 98.667 |
| 4874 | 98.667 |
| 4875 | 99 |
| 4876 | 99 |
| 4877 | 99.833 |
| 4878 | 100 |
| 4879 | 101.167 |
| 4880 | 101.167 |
| 4881 | 102 |
| 4882 | 102.167 |
| 4883 | 102.833 |
| 4884 | 103 |
| 4885 | 103.5 |
| 4886 | 103.667 |
| 4887 | 104.167 |
| 4888 | 104.167 |
| 4889 | 104.5 |
| 4890 | 104.333 |
| 4891 | 104.667 |
| 4892 | 104.667 |
| 4893 | 104.5 |
| 4894 | 104.5 |
| 4895 | 104.5 |
| 4896 | 104.5 |
| 4897 | 104.667 |
| 4898 | 104.5 |
| 4899 | 104.5 |
| 4900 | 104.167 |
| 4901 | 104.167 |
| 4902 | 104 |
| 4903 | 103.833 |
| 4904 | 103.833 |
| 4905 | 103.667 |
| 4906 | 103.667 |
| 4907 | 103.5 |
| 4908 | 103.5 |
| 4909 | 103.5 |
| 4910 | 103.5 |
| 4911 | 103.5 |
| 4912 | 103.333 |
| 4913 | 103.333 |
| 4914 | 103 |
| 4915 | 103 |
| 4916 | 102.667 |
| 4917 | 102.5 |
| 4918 | 102.333 |
| 4919 | 102.167 |
| 4920 | 102 |
| 4921 | 101.833 |
| 4922 | 101.167 |
| 4923 | 101 |
| 4924 | 100.5 |
| 4925 | 100.5 |
| 4926 | 100.333 |
| 4927 | 100.333 |
| 4928 | 99.667 |
| 4929 | 99.667 |
| 4930 | 99 |
| 4931 | 99 |
| 4932 | 99.333 |
| 4933 | 99.333 |
| 4934 | 100 |
| 4935 | 100.167 |
| 4936 | 100.667 |
| 4937 | 100.667 |
| 4938 | 101 |
| 4939 | 101.167 |
| 4940 | 101.5 |
| 4941 | 101.333 |
| 4942 | 101.5 |
| 4943 | 101.333 |
| 4944 | 101.167 |
| 4945 | 100.333 |
| 4946 | 100.333 |
| 4947 | 99.833 |
| 4948 | 99.833 |
| 4949 | 99.333 |
| 4950 | 99.333 |
| 4951 | 98.5 |
| 4952 | 98.5 |
| 4953 | 98 |
| 4954 | 98 |
| 4955 | 98 |
| 4956 | 97.833 |
| 4957 | 97.833 |
| 4958 | 97.833 |
| 4959 | 97.833 |
| 4960 | 97.833 |
| 4961 | 97.833 |
| 4962 | 97.667 |
| 4963 | 98 |
| 4964 | 97.833 |
| 4965 | 97.833 |
| 4966 | 97.833 |
| 4967 | 97.833 |
| 4968 | 97.833 |
| 4969 | 97.667 |
| 4970 | 97.333 |
| 4971 | 97.333 |
| 4972 | 96.833 |
| 4973 | 96.833 |
| 4974 | 96.833 |
| 4975 | 96.833 |
| 4976 | 97 |
| 4977 | 97 |
| 4978 | 97.167 |
| 4979 | 97.167 |
| 4980 | 97.667 |
| 4981 | 97.667 |
| 4982 | 97.833 |
| 4983 | 97.833 |
| 4984 | 97.833 |
| 4985 | 97.833 |
| 4986 | 97.5 |
| 4987 | 97.333 |
| 4988 | 96.833 |
| 4989 | 96.833 |
| 4990 | 96.5 |
| 4991 | 96.5 |
| 4992 | 96.167 |
| 4993 | 96 |
| 4994 | 95.833 |
| 4995 | 95.833 |
| 4996 | 96.333 |
| 4997 | 96.333 |
| 4998 | 96.667 |
| 4999 | 96.667 |
| 5000 | 97.333 |
| 5001 | 97.5 |
| 5002 | 97.667 |
| 5003 | 97.833 |
| 5004 | 97.833 |
| 5005 | 97.833 |
| 5006 | 98.167 |
| 5007 | 98.167 |
| 5008 | 98.333 |
| 5009 | 98.333 |
| 5010 | 99 |
| 5011 | 99 |
| 5012 | 99.167 |
| 5013 | 99.333 |
| 5014 | 99.833 |
| 5015 | 99.833 |
| 5016 | 100.333 |
| 5017 | 100.5 |
| 5018 | 101.167 |
| 5019 | 101.167 |
| 5020 | 101.667 |
| 5021 | 101.833 |
| 5022 | 102.333 |
| 5023 | 102.5 |
| 5024 | 102.833 |
| 5025 | 102.833 |
| 5026 | 103 |
| 5027 | 103 |
| 5028 | 102.5 |
| 5029 | 102.5 |
| 5030 | 102.167 |
| 5031 | 102.167 |
| 5032 | 102 |
| 5033 | 102 |
| 5034 | 102 |
| 5035 | 102 |
| 5036 | 101.833 |
| 5037 | 101.833 |
| 5038 | 101.5 |
| 5039 | 101.5 |
| 5040 | 101.167 |
| 5041 | 101.167 |
| 5042 | 101.167 |
| 5043 | 101.167 |
| 5044 | 101.167 |
| 5045 | 101 |
| 5046 | 101 |
| 5047 | 100.833 |
| 5048 | 100.833 |
| 5049 | 100.833 |
| 5050 | 101.167 |
| 5051 | 101.167 |
| 5052 | 101.333 |
| 5053 | 101.333 |
| 5054 | 101.333 |
| 5055 | 101.333 |
| 5056 | 101.333 |
| 5057 | 101.333 |
| 5058 | 100.833 |
| 5059 | 100.833 |
| 5060 | 100.5 |
| 5061 | 100.333 |
| 5062 | 100 |
| 5063 | 100 |
| 5064 | 99.5 |
| 5065 | 99.667 |
| 5066 | 99.5 |
| 5067 | 99.5 |
| 5068 | 99.167 |
| 5069 | 99.167 |
| 5070 | 99.167 |
| 5071 | 99.167 |
| 5072 | 99.167 |
| 5073 | 99.167 |
| 5074 | 98.833 |
| 5075 | 98.833 |
| 5076 | 98.833 |
| 5077 | 98.833 |
| 5078 | 98.833 |
| 5079 | 99 |
| 5080 | 99.333 |
| 5081 | 99.167 |
| 5082 | 99.5 |
| 5083 | 99.5 |
| 5084 | 100 |
| 5085 | 100 |
| 5086 | 100.5 |
| 5087 | 100.5 |
| 5088 | 100.833 |
| 5089 | 100.667 |
| 5090 | 100.833 |
| 5091 | 100.667 |
| 5092 | 100.667 |
| 5093 | 100.667 |
| 5094 | 100.333 |
| 5095 | 100.333 |
| 5096 | 100 |
| 5097 | 100 |
| 5098 | 100.167 |
| 5099 | 100 |
| 5100 | 100.167 |
| 5101 | 100.167 |
| 5102 | 100.167 |
| 5103 | 100.333 |
| 5104 | 100.333 |
| 5105 | 100.5 |
| 5106 | 100.5 |
| 5107 | 100.5 |
| 5108 | 100.667 |
| 5109 | 100.333 |
| 5110 | 100.333 |
| 5111 | 100.333 |
| 5112 | 100.167 |
| 5113 | 100 |
| 5114 | 99.833 |
| 5115 | 99.833 |
| 5116 | 99.833 |
| 5117 | 99.667 |
| 5118 | 99.667 |
| 5119 | 99.833 |
| 5120 | 99.833 |
| 5121 | 100 |
| 5122 | 100 |
| 5123 | 99.833 |
| 5124 | 100 |
| 5125 | 100.333 |
| 5126 | 100.333 |
| 5127 | 100.167 |
| 5128 | 99.833 |
| 5129 | 99.5 |
| 5130 | 99.5 |
| 5131 | 98.667 |
| 5132 | 98.5 |
| 5133 | 98 |
| 5134 | 97.833 |
| 5135 | 97.5 |
| 5136 | 97.5 |
| 5137 | 97.333 |
| 5138 | 97.5 |
| 5139 | 97.333 |
| 5140 | 97.333 |
| 5141 | 97.5 |
| 5142 | 97.5 |
| 5143 | 97.667 |
| 5144 | 97.833 |
| 5145 | 98 |
| 5146 | 98 |
| 5147 | 97.833 |
| 5148 | 97.833 |
| 5149 | 98 |
| 5150 | 98 |
| 5151 | 98 |
| 5152 | 98 |
| 5153 | 98.5 |
| 5154 | 98.5 |
| 5155 | 99 |
| 5156 | 99 |
| 5157 | 99 |
| 5158 | 99.167 |
| 5159 | 99.5 |
| 5160 | 99.5 |
| 5161 | 99.833 |
| 5162 | 99.833 |
| 5163 | 99.833 |
| 5164 | 99.833 |
| 5165 | 100.167 |
| 5166 | 100 |
| 5167 | 99.833 |
| 5168 | 99.833 |
| 5169 | 99.167 |
| 5170 | 99.167 |
| 5171 | 98.667 |
| 5172 | 98.667 |
| 5173 | 98.333 |
| 5174 | 98.167 |
| 5175 | 97.833 |
| 5176 | 97.833 |
| 5177 | 97.833 |
| 5178 | 97.833 |
| 5179 | 98.167 |
| 5180 | 98.333 |
| 5181 | 98.5 |
| 5182 | 99 |
| 5183 | 99 |
| 5184 | 99.5 |
| 5185 | 99.667 |
| 5186 | 99.833 |
| 5187 | 99.667 |
| 5188 | 98.667 |
| 5189 | 98.333 |
| 5190 | 97.5 |
| 5191 | 97.5 |
| 5192 | 96 |
| 5193 | 95.833 |
| 5194 | 94.667 |
| 5195 | 94.5 |
| 5196 | 93.333 |
| 5197 | 93.167 |
| 5198 | 92.5 |
| 5199 | 92.5 |
| 5200 | 91.667 |
| 5201 | 91.5 |
| 5202 | 91 |
| 5203 | 90.833 |
| 5204 | 90 |
| 5205 | 89.833 |
| 5206 | 89.167 |
| 5207 | 88.833 |
| 5208 | 88.333 |
| 5209 | 88.167 |
| 5210 | 87 |
| 5211 | 86.833 |
| 5212 | 85.833 |
| 5213 | 84.667 |
| 5214 | 84.5 |
| 5215 | 83.5 |
| 5216 | 83.5 |
| 5217 | 82.833 |
| 5218 | 82.667 |
| 5219 | 81.5 |
| 5220 | 81.5 |
| 5221 | 81 |
| 5222 | 81 |
| 5223 | 80.5 |
| 5224 | 80.333 |
| 5225 | 79.833 |
| 5226 | 79.833 |
| 5227 | 79.167 |
| 5228 | 78.333 |
| 5229 | 78.333 |
| 5230 | 77.833 |
| 5231 | 77.833 |
| 5232 | 77.333 |
| 5233 | 77.333 |
| 5234 | 77 |
| 5235 | 77 |
| 5236 | 76.667 |
| 5237 | 76.667 |
| 5238 | 75.833 |
| 5239 | 75.667 |
| 5240 | 74.667 |
| 5241 | 74.5 |
| 5242 | 73.333 |
| 5243 | 73.333 |
| 5244 | 72 |
| 5245 | 72 |
| 5246 | 70.833 |
| 5247 | 70.5 |
| 5248 | 69.5 |
| 5249 | 69.5 |
| 5250 | 68.167 |
| 5251 | 68 |
| 5252 | 66.833 |
| 5253 | 66.667 |
| 5254 | 65.667 |
| 5255 | 65.667 |
| 5256 | 64.667 |
| 5257 | 64.5 |
| 5258 | 63.833 |
| 5259 | 63.667 |
| 5260 | 63.5 |
| 5261 | 63.333 |
| 5262 | 62.667 |
| 5263 | 62.5 |
| 5264 | 62 |
| 5265 | 61.833 |
| 5266 | 61.333 |
| 5267 | 61.167 |
| 5268 | 60.5 |
| 5269 | 60.333 |
| 5270 | 59.833 |
| 5271 | 59.667 |
| 5272 | 58.833 |
| 5273 | 58.667 |
| 5274 | 58 |
| 5275 | 58 |
| 5276 | 57 |
| 5277 | 56.833 |
| 5278 | 56 |
| 5279 | 55.833 |
| 5280 | 54.833 |
| 5281 | 54.667 |
| 5282 | 54.167 |
| 5283 | 54.167 |
| 5284 | 53.333 |
| 5285 | 53.167 |
| 5286 | 52.333 |
| 5287 | 52.167 |
| 5288 | 51.333 |
| 5289 | 51.333 |
| 5290 | 50.5 |
| 5291 | 50.333 |
| 5292 | 49.667 |
| 5293 | 49.5 |
| 5294 | 48.667 |
| 5295 | 48.167 |
| 5296 | 47.167 |
| 5297 | 47 |
| 5298 | 45.833 |
| 5299 | 45.5 |
| 5300 | 44.333 |
| 5301 | 44.333 |
| 5302 | 43 |
| 5303 | 42.667 |
| 5304 | 41 |
| 5305 | 40.833 |
| 5306 | 39.333 |
| 5307 | 39 |
| 5308 | 37.667 |
| 5309 | 36.333 |
| 5310 | 36.167 |
| 5311 | 36.167 |
| 5312 | 35.833 |
| 5313 | 36 |
| 5314 | 36.333 |
| 5315 | 36.333 |
| 5316 | 37 |
| 5317 | 37 |
| 5318 | 37.5 |
| 5319 | 37.667 |
| 5320 | 37.833 |
| 5321 | 38 |
| 5322 | 38.333 |
| 5323 | 38.333 |
| 5324 | 38.333 |
| 5325 | 38.333 |
| 5326 | 38.5 |
| 5327 | 38.5 |
| 5328 | 38.833 |
| 5329 | 38.833 |
| 5330 | 38.667 |
| 5331 | 38.667 |
| 5332 | 38.833 |
| 5333 | 38.833 |
| 5334 | 38.667 |
| 5335 | 38.667 |
| 5336 | 38.667 |
| 5337 | 38.667 |
| 5338 | 38.167 |
| 5339 | 37.833 |
| 5340 | 37.333 |
| 5341 | 36.833 |
| 5342 | 36.5 |
| 5343 | 36.333 |
| 5344 | 35.5 |
| 5345 | 35.333 |
| 5346 | 34.167 |
| 5347 | 34 |
| 5348 | 33.5 |
| 5349 | 33.5 |
| 5350 | 33.167 |
| 5351 | 33.167 |
| 5352 | 33.167 |
| 5353 | 33.167 |
| 5354 | 33 |
| 5355 | 33.167 |
| 5356 | 33.333 |
| 5357 | 33.333 |
| 5358 | 33.667 |
| 5359 | 33.667 |
| 5360 | 34 |
| 5361 | 34.167 |
| 5362 | 34.5 |
| 5363 | 34.5 |
| 5364 | 34.833 |
| 5365 | 34.667 |
| 5366 | 35 |
| 5367 | 35 |
| 5368 | 35.333 |
| 5369 | 35.333 |
| 5370 | 35.833 |
| 5371 | 35.833 |
| 5372 | 35.667 |
| 5373 | 35.667 |
| 5374 | 35.5 |
| 5375 | 35.5 |
| 5376 | 35.333 |
| 5377 | 35.333 |
| 5378 | 35.333 |
| 5379 | 35.167 |
| 5380 | 35.333 |
| 5381 | 35.333 |
| 5382 | 35.333 |
| 5383 | 35.5 |
| 5384 | 35.5 |
| 5385 | 35.667 |
| 5386 | 35.5 |
| 5387 | 35.5 |
| 5388 | 35.167 |
| 5389 | 35.333 |
| 5390 | 35.167 |
| 5391 | 35.167 |
| 5392 | 35.167 |
| 5393 | 35.167 |
| 5394 | 35.167 |
| 5395 | 35 |
| 5396 | 34.5 |
| 5397 | 34.333 |
| 5398 | 33.667 |
| 5399 | 33.667 |
| 5400 | 32.667 |
| 5401 | 32.667 |
| 5402 | 32 |
| 5403 | 32 |
| 5404 | 32 |
| 5405 | 32 |
| 5406 | 32.333 |
| 5407 | 32.333 |
| 5408 | 32.833 |
| 5409 | 32.833 |
| 5410 | 33.333 |
| 5411 | 33.333 |
| 5412 | 33.5 |
| 5413 | 33.5 |
| 5414 | 33.833 |
| 5415 | 33.833 |
| 5416 | 34.167 |
| 5417 | 34.167 |
| 5418 | 34.333 |
| 5419 | 34.167 |
| 5420 | 34.5 |
| 5421 | 34.5 |
| 5422 | 34.667 |
| 5423 | 34.667 |
| 5424 | 34.5 |
| 5425 | 34.5 |
| 5426 | 34.333 |
| 5427 | 34.333 |
| 5428 | 34.333 |
| 5429 | 34.5 |
| 5430 | 34.5 |
| 5431 | 34.5 |
| 5432 | 34.5 |
| 5433 | 34.833 |
| 5434 | 34.833 |
| 5435 | 35.333 |
| 5436 | 35.5 |
| 5437 | 35.833 |
| 5438 | 35.833 |
| 5439 | 36.5 |
| 5440 | 36.5 |
| 5441 | 37 |
| 5442 | 37.167 |
| 5443 | 37.5 |
| 5444 | 37.5 |
| 5445 | 37.333 |
| 5446 | 37.5 |
| 5447 | 37.167 |
| 5448 | 37 |
| 5449 | 36.333 |
| 5450 | 36.333 |
| 5451 | 35.667 |
| 5452 | 35.667 |
| 5453 | 35 |
| 5454 | 35 |
| 5455 | 34.5 |
| 5456 | 34.333 |
| 5457 | 33.667 |
| 5458 | 33.667 |
| 5459 | 33.167 |
| 5460 | 33 |
| 5461 | 32.333 |
| 5462 | 32.167 |
| 5463 | 31.667 |
| 5464 | 31.667 |
| 5465 | 31.333 |
| 5466 | 31.333 |
| 5467 | 31.167 |
| 5468 | 31.167 |
| 5469 | 30.833 |
| 5470 | 30.667 |
| 5471 | 30.5 |
| 5472 | 30.333 |
| 5473 | 29.5 |
| 5474 | 29.333 |
| 5475 | 28.833 |
| 5476 | 28.667 |
| 5477 | 28 |
| 5478 | 27.833 |
| 5479 | 27 |
| 5480 | 27 |
| 5481 | 26.333 |
| 5482 | 26.333 |
| 5483 | 25.333 |
| 5484 | 25.333 |
| 5485 | 24.167 |
| 5486 | 24 |
| 5487 | 22.833 |
| 5488 | 22.667 |
| 5489 | 21.667 |
| 5490 | 21.5 |
| 5491 | 20.5 |
| 5492 | 20.333 |
| 5493 | 19.167 |
| 5494 | 19.167 |
| 5495 | 18.333 |
| 5496 | 18 |
| 5497 | 16.833 |
| 5498 | 16.667 |
| 5499 | 16.167 |
| 5500 | 16.167 |
| 5501 | 16 |
| 5502 | 16 |
| 5503 | 15.5 |
| 5504 | 15.333 |
| 5505 | 14.667 |
| 5506 | 14.667 |
| 5507 | 14.167 |
| 5508 | 14 |
| 5509 | 13.833 |
| 5510 | 13.5 |
| 5511 | 12.833 |
| 5512 | 12.667 |
| 5513 | 12.167 |
| 5514 | 12 |
| 5515 | 11.333 |
| 5516 | 11.167 |
| 5517 | 10.333 |
| 5518 | 10.167 |
| 5519 | 9.167 |
| 5520 | 9.167 |
| 5521 | 8.667 |
| 5522 | 8.5 |
| 5523 | 7.5 |
| 5524 | 7.5 |
| 5525 | 6.333 |
| 5526 | 6.333 |
| 5527 | 5.333 |
| 5528 | 5.167 |
| 5529 | 4.5 |
| 5530 | 4.167 |
| 5531 | 3.667 |
| 5532 | 3.5 |
| 5533 | 3 |
| 5534 | 3 |
| 5535 | 2.667 |
| 5536 | 2.5 |
| 5537 | 2.167 |
| 5538 | 2 |
| 5539 | 1.833 |
| 5540 | 1.833 |
| 5541 | 1.833 |
| 5542 | 1.333 |
| 5543 | 1.333 |
| 5544 | 0.667 |
| 5545 | 0.667 |
| 5546 | -0.333 |
| 5547 | -0.333 |
| 5548 | -0.667 |
| 5549 | -0.667 |
| 5550 | -0.833 |
| 5551 | -0.667 |
| 5552 | -0.833 |
| 5553 | -0.833 |
| 5554 | -1 |
| 5555 | -1.167 |
| 5556 | -1.167 |
| 5557 | -1.167 |
| 5558 | -1.333 |
| 5559 | -1.5 |
| 5560 | -2 |
| 5561 | -2 |
| 5562 | -2 |
| 5563 | -2 |
| 5564 | -1.833 |
| 5565 | -1.833 |
| 5566 | -1.5 |
| 5567 | -1.333 |
| 5568 | -1 |
| 5569 | -1.167 |
| 5570 | -1.167 |
| 5571 | -1.167 |
| 5572 | -1.333 |
| 5573 | -1.333 |
| 5574 | -1.333 |
| 5575 | -1.333 |
| 5576 | -1.167 |
| 5577 | -1.333 |
| 5578 | -1.333 |
| 5579 | -1.167 |
| 5580 | -1.333 |
| 5581 | -1.333 |
| 5582 | -1.333 |
| 5583 | -1.333 |
| 5584 | -1.5 |
| 5585 | -1.5 |
| 5586 | -1.167 |
| 5587 | -1.167 |
| 5588 | -1.167 |
| 5589 | -1.167 |
| 5590 | -1.333 |
| 5591 | -1.333 |
| 5592 | -1.333 |
| 5593 | -1.5 |
| 5594 | -1.333 |
| 5595 | -1.333 |
| 5596 | -1.5 |
| 5597 | -1.333 |
| 5598 | -1.333 |
| 5599 | -1.5 |
| 5600 | -1.5 |
| 5601 | -1.5 |
| 5602 | -1.333 |
| 5603 | -1.333 |
| 5604 | -1.333 |
| 5605 | -1.5 |
| 5606 | -1.5 |
| 5607 | -1.333 |
| 5608 | -1.333 |
| 5609 | -1.333 |
| 5610 | -1.333 |
| 5611 | -1.5 |
| 5612 | -1.5 |
| 5613 | -1.5 |
| 5614 | -1.333 |
| 5615 | -1.333 |
| 5616 | -1.333 |
| 5617 | -1.333 |
| 5618 | -1.333 |
| 5619 | -1.167 |
| 5620 | -1.333 |
| 5621 | -1.167 |
| 5622 | -1.167 |
| 5623 | -1.167 |
| 5624 | -1.333 |
| 5625 | -1.333 |
| 5626 | -1 |
| 5627 | -1.167 |
| 5628 | -1 |
| 5629 | -1.167 |
| 5630 | -1.167 |